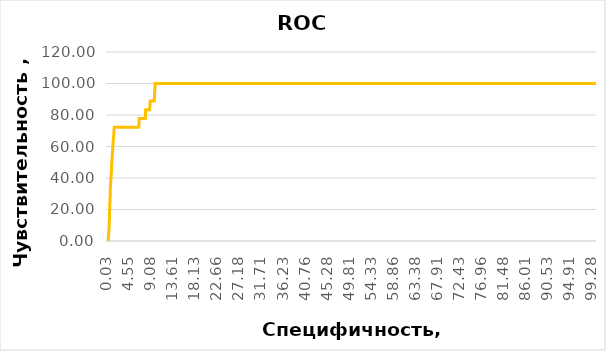
| Category | Series 0 |
|---|---|
| 0.029967036260113877 | 0 |
| 0.059934072520227755 | 0 |
| 0.08990110878034162 | 0 |
| 0.11986814504045551 | 0 |
| 0.1498351813005694 | 0 |
| 0.17980221756068324 | 0 |
| 0.2097692538207971 | 0 |
| 0.23973629008091102 | 0 |
| 0.26970332634102484 | 0 |
| 0.2996703626011388 | 0 |
| 0.3296373988612526 | 0 |
| 0.3596044351213665 | 0 |
| 0.3895714713814804 | 5.556 |
| 0.4195385076415942 | 5.556 |
| 0.4495055439017081 | 5.556 |
| 0.47947258016182204 | 11.111 |
| 0.5094396164219359 | 11.111 |
| 0.5394066526820497 | 16.667 |
| 0.5693736889421637 | 22.222 |
| 0.5993407252022775 | 22.222 |
| 0.6293077614623913 | 22.222 |
| 0.6592747977225052 | 27.778 |
| 0.6892418339826192 | 33.333 |
| 0.719208870242733 | 33.333 |
| 0.7491759065028468 | 33.333 |
| 0.7791429427629608 | 33.333 |
| 0.8091099790230747 | 38.889 |
| 0.8390770152831885 | 38.889 |
| 0.8690440515433023 | 38.889 |
| 0.8990110878034162 | 38.889 |
| 0.92897812406353 | 44.444 |
| 0.9589451603236441 | 44.444 |
| 0.988912196583758 | 50 |
| 1.0188792328438718 | 50 |
| 1.0488462691039857 | 50 |
| 1.0788133053640994 | 50 |
| 1.1087803416242132 | 50 |
| 1.1387473778843273 | 55.556 |
| 1.1687144141444412 | 55.556 |
| 1.198681450404555 | 55.556 |
| 1.228648486664669 | 61.111 |
| 1.2586155229247826 | 61.111 |
| 1.2885825591848965 | 61.111 |
| 1.3185495954450104 | 61.111 |
| 1.3485166317051245 | 61.111 |
| 1.3784836679652384 | 66.667 |
| 1.4084507042253522 | 66.667 |
| 1.438417740485466 | 66.667 |
| 1.4683847767455798 | 66.667 |
| 1.4983518130056936 | 72.222 |
| 1.5283188492658075 | 72.222 |
| 1.5582858855259216 | 72.222 |
| 1.5882529217860355 | 72.222 |
| 1.6182199580461494 | 72.222 |
| 1.648186994306263 | 72.222 |
| 1.678154030566377 | 72.222 |
| 1.7081210668264908 | 72.222 |
| 1.7380881030866047 | 72.222 |
| 1.7680551393467185 | 72.222 |
| 1.7980221756068324 | 72.222 |
| 1.8279892118669463 | 72.222 |
| 1.85795624812706 | 72.222 |
| 1.8879232843871743 | 72.222 |
| 1.9178903206472881 | 72.222 |
| 1.947857356907402 | 72.222 |
| 1.977824393167516 | 72.222 |
| 2.0077914294276296 | 72.222 |
| 2.0377584656877437 | 72.222 |
| 2.0677255019478573 | 72.222 |
| 2.0976925382079714 | 72.222 |
| 2.127659574468085 | 72.222 |
| 2.1576266107281987 | 72.222 |
| 2.187593646988313 | 72.222 |
| 2.2175606832484265 | 72.222 |
| 2.2475277195085406 | 72.222 |
| 2.2774947557686547 | 72.222 |
| 2.3074617920287683 | 72.222 |
| 2.3374288282888824 | 72.222 |
| 2.367395864548996 | 72.222 |
| 2.39736290080911 | 72.222 |
| 2.427329937069224 | 72.222 |
| 2.457296973329338 | 72.222 |
| 2.4872640095894516 | 72.222 |
| 2.5172310458495653 | 72.222 |
| 2.5471980821096794 | 72.222 |
| 2.577165118369793 | 72.222 |
| 2.607132154629907 | 72.222 |
| 2.6370991908900208 | 72.222 |
| 2.667066227150135 | 72.222 |
| 2.697033263410249 | 72.222 |
| 2.7270002996703626 | 72.222 |
| 2.7569673359304767 | 72.222 |
| 2.7869343721905904 | 72.222 |
| 2.8169014084507045 | 72.222 |
| 2.846868444710818 | 72.222 |
| 2.876835480970932 | 72.222 |
| 2.906802517231046 | 72.222 |
| 2.9367695534911595 | 72.222 |
| 2.9667365897512736 | 72.222 |
| 2.9967036260113873 | 72.222 |
| 3.0266706622715014 | 72.222 |
| 3.056637698531615 | 72.222 |
| 3.086604734791729 | 72.222 |
| 3.1165717710518432 | 72.222 |
| 3.146538807311957 | 72.222 |
| 3.176505843572071 | 72.222 |
| 3.2064728798321847 | 72.222 |
| 3.2364399160922988 | 72.222 |
| 3.2664069523524124 | 72.222 |
| 3.296373988612526 | 72.222 |
| 3.32634102487264 | 72.222 |
| 3.356308061132754 | 72.222 |
| 3.386275097392868 | 72.222 |
| 3.4162421336529816 | 72.222 |
| 3.4462091699130957 | 72.222 |
| 3.4761762061732093 | 72.222 |
| 3.506143242433323 | 72.222 |
| 3.536110278693437 | 72.222 |
| 3.5660773149535507 | 72.222 |
| 3.596044351213665 | 72.222 |
| 3.6260113874737785 | 72.222 |
| 3.6559784237338926 | 72.222 |
| 3.6859454599940062 | 72.222 |
| 3.71591249625412 | 72.222 |
| 3.745879532514235 | 72.222 |
| 3.7758465687743485 | 72.222 |
| 3.805813605034462 | 72.222 |
| 3.8357806412945763 | 72.222 |
| 3.86574767755469 | 72.222 |
| 3.895714713814804 | 72.222 |
| 3.9256817500749177 | 72.222 |
| 3.955648786335032 | 72.222 |
| 3.9856158225951455 | 72.222 |
| 4.015582858855259 | 72.222 |
| 4.045549895115373 | 72.222 |
| 4.075516931375487 | 72.222 |
| 4.1054839676356005 | 72.222 |
| 4.135451003895715 | 72.222 |
| 4.165418040155829 | 72.222 |
| 4.195385076415943 | 72.222 |
| 4.225352112676056 | 72.222 |
| 4.25531914893617 | 72.222 |
| 4.285286185196284 | 72.222 |
| 4.3152532214563974 | 72.222 |
| 4.3452202577165115 | 72.222 |
| 4.375187293976626 | 72.222 |
| 4.40515433023674 | 72.222 |
| 4.435121366496853 | 72.222 |
| 4.465088402756967 | 72.222 |
| 4.495055439017081 | 72.222 |
| 4.525022475277194 | 72.222 |
| 4.554989511537309 | 72.222 |
| 4.5849565477974235 | 72.222 |
| 4.614923584057537 | 72.222 |
| 4.644890620317651 | 72.222 |
| 4.674857656577765 | 72.222 |
| 4.704824692837879 | 72.222 |
| 4.734791729097992 | 72.222 |
| 4.764758765358106 | 72.222 |
| 4.79472580161822 | 72.222 |
| 4.824692837878334 | 72.222 |
| 4.854659874138448 | 72.222 |
| 4.884626910398562 | 72.222 |
| 4.914593946658676 | 72.222 |
| 4.944560982918789 | 72.222 |
| 4.974528019178903 | 72.222 |
| 5.004495055439017 | 72.222 |
| 5.0344620916991305 | 72.222 |
| 5.064429127959245 | 72.222 |
| 5.094396164219359 | 72.222 |
| 5.124363200479473 | 72.222 |
| 5.154330236739586 | 72.222 |
| 5.1842972729997 | 72.222 |
| 5.214264309259814 | 72.222 |
| 5.244231345519927 | 72.222 |
| 5.2741983817800415 | 72.222 |
| 5.304165418040156 | 72.222 |
| 5.33413245430027 | 72.222 |
| 5.364099490560383 | 72.222 |
| 5.394066526820498 | 72.222 |
| 5.424033563080612 | 72.222 |
| 5.454000599340725 | 72.222 |
| 5.483967635600839 | 72.222 |
| 5.513934671860953 | 72.222 |
| 5.543901708121067 | 72.222 |
| 5.573868744381181 | 72.222 |
| 5.603835780641295 | 72.222 |
| 5.633802816901409 | 72.222 |
| 5.663769853161522 | 72.222 |
| 5.693736889421636 | 72.222 |
| 5.72370392568175 | 72.222 |
| 5.753670961941864 | 72.222 |
| 5.783637998201978 | 72.222 |
| 5.813605034462092 | 72.222 |
| 5.843572070722206 | 72.222 |
| 5.873539106982319 | 72.222 |
| 5.903506143242433 | 72.222 |
| 5.933473179502547 | 72.222 |
| 5.963440215762661 | 72.222 |
| 5.993407252022775 | 72.222 |
| 6.023374288282889 | 72.222 |
| 6.053341324543003 | 72.222 |
| 6.083308360803116 | 72.222 |
| 6.11327539706323 | 72.222 |
| 6.143242433323344 | 72.222 |
| 6.173209469583458 | 72.222 |
| 6.203176505843572 | 72.222 |
| 6.2331435421036865 | 72.222 |
| 6.2631105783638 | 72.222 |
| 6.293077614623914 | 72.222 |
| 6.323044650884027 | 72.222 |
| 6.353011687144142 | 72.222 |
| 6.382978723404255 | 72.222 |
| 6.412945759664369 | 72.222 |
| 6.4429127959244825 | 72.222 |
| 6.4728798321845975 | 72.222 |
| 6.50284686844471 | 72.222 |
| 6.532813904704825 | 72.222 |
| 6.562780940964938 | 72.222 |
| 6.592747977225052 | 72.222 |
| 6.622715013485167 | 77.778 |
| 6.65268204974528 | 77.778 |
| 6.682649086005394 | 77.778 |
| 6.712616122265508 | 77.778 |
| 6.742583158525623 | 77.778 |
| 6.772550194785736 | 77.778 |
| 6.80251723104585 | 77.778 |
| 6.832484267305963 | 77.778 |
| 6.862451303566078 | 77.778 |
| 6.892418339826191 | 77.778 |
| 6.922385376086305 | 77.778 |
| 6.952352412346419 | 77.778 |
| 6.982319448606534 | 77.778 |
| 7.012286484866646 | 77.778 |
| 7.042253521126761 | 77.778 |
| 7.072220557386874 | 77.778 |
| 7.102187593646988 | 77.778 |
| 7.1321546299071015 | 77.778 |
| 7.1621216661672165 | 77.778 |
| 7.19208870242733 | 77.778 |
| 7.222055738687444 | 77.778 |
| 7.252022774947557 | 77.778 |
| 7.281989811207672 | 77.778 |
| 7.311956847467785 | 77.778 |
| 7.341923883727899 | 77.778 |
| 7.3718909199880125 | 77.778 |
| 7.4018579562481275 | 77.778 |
| 7.43182499250824 | 77.778 |
| 7.461792028768355 | 77.778 |
| 7.49175906502847 | 77.778 |
| 7.521726101288582 | 77.778 |
| 7.551693137548697 | 77.778 |
| 7.58166017380881 | 77.778 |
| 7.611627210068924 | 77.778 |
| 7.641594246329038 | 77.778 |
| 7.671561282589153 | 77.778 |
| 7.701528318849266 | 77.778 |
| 7.73149535510938 | 77.778 |
| 7.761462391369493 | 77.778 |
| 7.791429427629608 | 77.778 |
| 7.821396463889721 | 77.778 |
| 7.851363500149835 | 77.778 |
| 7.881330536409949 | 77.778 |
| 7.911297572670064 | 77.778 |
| 7.941264608930176 | 83.333 |
| 7.971231645190291 | 83.333 |
| 8.001198681450404 | 83.333 |
| 8.031165717710518 | 83.333 |
| 8.061132753970632 | 83.333 |
| 8.091099790230746 | 83.333 |
| 8.121066826490859 | 83.333 |
| 8.151033862750975 | 83.333 |
| 8.181000899011087 | 83.333 |
| 8.210967935271201 | 83.333 |
| 8.240934971531315 | 83.333 |
| 8.27090200779143 | 83.333 |
| 8.300869044051543 | 83.333 |
| 8.330836080311657 | 83.333 |
| 8.360803116571772 | 83.333 |
| 8.390770152831886 | 83.333 |
| 8.420737189092 | 83.333 |
| 8.450704225352112 | 83.333 |
| 8.480671261612226 | 83.333 |
| 8.51063829787234 | 83.333 |
| 8.540605334132454 | 83.333 |
| 8.570572370392568 | 83.333 |
| 8.600539406652683 | 83.333 |
| 8.630506442912795 | 83.333 |
| 8.66047347917291 | 83.333 |
| 8.690440515433023 | 83.333 |
| 8.720407551693137 | 83.333 |
| 8.750374587953251 | 83.333 |
| 8.780341624213365 | 83.333 |
| 8.81030866047348 | 83.333 |
| 8.840275696733594 | 83.333 |
| 8.870242732993706 | 88.889 |
| 8.900209769253822 | 88.889 |
| 8.930176805513934 | 88.889 |
| 8.960143841774048 | 88.889 |
| 8.990110878034162 | 88.889 |
| 9.020077914294276 | 88.889 |
| 9.050044950554389 | 88.889 |
| 9.080011986814505 | 88.889 |
| 9.109979023074619 | 88.889 |
| 9.139946059334731 | 88.889 |
| 9.169913095594847 | 88.889 |
| 9.19988013185496 | 88.889 |
| 9.229847168115073 | 88.889 |
| 9.259814204375187 | 88.889 |
| 9.289781240635302 | 88.889 |
| 9.319748276895416 | 88.889 |
| 9.34971531315553 | 88.889 |
| 9.379682349415642 | 88.889 |
| 9.409649385675758 | 88.889 |
| 9.43961642193587 | 88.889 |
| 9.469583458195984 | 88.889 |
| 9.499550494456098 | 88.889 |
| 9.529517530716213 | 88.889 |
| 9.559484566976325 | 88.889 |
| 9.58945160323644 | 88.889 |
| 9.619418639496553 | 88.889 |
| 9.649385675756667 | 88.889 |
| 9.679352712016781 | 88.889 |
| 9.709319748276895 | 88.889 |
| 9.73928678453701 | 88.889 |
| 9.769253820797124 | 88.889 |
| 9.799220857057236 | 94.444 |
| 9.829187893317352 | 94.444 |
| 9.859154929577464 | 94.444 |
| 9.889121965837578 | 100 |
| 9.919089002097694 | 100 |
| 9.949056038357806 | 100 |
| 9.97902307461792 | 100 |
| 10.008990110878035 | 100 |
| 10.038957147138149 | 100 |
| 10.068924183398261 | 100 |
| 10.098891219658377 | 100 |
| 10.12885825591849 | 100 |
| 10.158825292178603 | 100 |
| 10.188792328438717 | 100 |
| 10.218759364698832 | 100 |
| 10.248726400958946 | 100 |
| 10.27869343721906 | 100 |
| 10.308660473479172 | 100 |
| 10.338627509739288 | 100 |
| 10.3685945459994 | 100 |
| 10.398561582259514 | 100 |
| 10.428528618519628 | 100 |
| 10.458495654779743 | 100 |
| 10.488462691039855 | 100 |
| 10.51842972729997 | 100 |
| 10.548396763560083 | 100 |
| 10.578363799820197 | 100 |
| 10.608330836080311 | 100 |
| 10.638297872340425 | 100 |
| 10.66826490860054 | 100 |
| 10.698231944860654 | 100 |
| 10.728198981120766 | 100 |
| 10.758166017380882 | 100 |
| 10.788133053640996 | 100 |
| 10.818100089901108 | 100 |
| 10.848067126161224 | 100 |
| 10.878034162421336 | 100 |
| 10.90800119868145 | 100 |
| 10.937968234941565 | 100 |
| 10.967935271201679 | 100 |
| 10.997902307461791 | 100 |
| 11.027869343721907 | 100 |
| 11.05783637998202 | 100 |
| 11.087803416242133 | 100 |
| 11.117770452502247 | 100 |
| 11.147737488762361 | 100 |
| 11.177704525022476 | 100 |
| 11.20767156128259 | 100 |
| 11.237638597542702 | 100 |
| 11.267605633802818 | 100 |
| 11.29757267006293 | 100 |
| 11.327539706323044 | 100 |
| 11.357506742583158 | 100 |
| 11.387473778843272 | 100 |
| 11.417440815103387 | 100 |
| 11.4474078513635 | 100 |
| 11.477374887623613 | 100 |
| 11.507341923883727 | 100 |
| 11.537308960143841 | 100 |
| 11.567275996403955 | 100 |
| 11.59724303266407 | 100 |
| 11.627210068924184 | 100 |
| 11.657177105184298 | 100 |
| 11.687144141444412 | 100 |
| 11.717111177704526 | 100 |
| 11.747078213964638 | 100 |
| 11.777045250224754 | 100 |
| 11.807012286484866 | 100 |
| 11.83697932274498 | 100 |
| 11.866946359005095 | 100 |
| 11.896913395265209 | 100 |
| 11.926880431525323 | 100 |
| 11.956847467785437 | 100 |
| 11.98681450404555 | 100 |
| 12.016781540305663 | 100 |
| 12.046748576565777 | 100 |
| 12.076715612825891 | 100 |
| 12.106682649086006 | 100 |
| 12.13664968534612 | 100 |
| 12.166616721606232 | 100 |
| 12.196583757866348 | 100 |
| 12.22655079412646 | 100 |
| 12.256517830386574 | 100 |
| 12.286484866646688 | 100 |
| 12.316451902906802 | 100 |
| 12.346418939166917 | 100 |
| 12.37638597542703 | 100 |
| 12.406353011687145 | 100 |
| 12.436320047947259 | 100 |
| 12.466287084207373 | 100 |
| 12.496254120467485 | 100 |
| 12.5262211567276 | 100 |
| 12.556188192987713 | 100 |
| 12.586155229247828 | 100 |
| 12.616122265507942 | 100 |
| 12.646089301768054 | 100 |
| 12.676056338028168 | 100 |
| 12.706023374288284 | 100 |
| 12.735990410548398 | 100 |
| 12.76595744680851 | 100 |
| 12.795924483068625 | 100 |
| 12.825891519328739 | 100 |
| 12.855858555588853 | 100 |
| 12.885825591848965 | 100 |
| 12.91579262810908 | 100 |
| 12.945759664369195 | 100 |
| 12.975726700629309 | 100 |
| 13.00569373688942 | 100 |
| 13.035660773149536 | 100 |
| 13.06562780940965 | 100 |
| 13.095594845669764 | 100 |
| 13.125561881929876 | 100 |
| 13.15552891818999 | 100 |
| 13.185495954450104 | 100 |
| 13.21546299071022 | 100 |
| 13.245430026970334 | 100 |
| 13.275397063230447 | 100 |
| 13.30536409949056 | 100 |
| 13.335331135750675 | 100 |
| 13.365298172010789 | 100 |
| 13.395265208270901 | 100 |
| 13.425232244531015 | 100 |
| 13.455199280791131 | 100 |
| 13.485166317051245 | 100 |
| 13.515133353311356 | 100 |
| 13.545100389571472 | 100 |
| 13.575067425831586 | 100 |
| 13.6050344620917 | 100 |
| 13.635001498351812 | 100 |
| 13.664968534611926 | 100 |
| 13.69493557087204 | 100 |
| 13.724902607132156 | 100 |
| 13.754869643392267 | 100 |
| 13.784836679652383 | 100 |
| 13.814803715912497 | 100 |
| 13.84477075217261 | 100 |
| 13.874737788432723 | 100 |
| 13.904704824692837 | 100 |
| 13.934671860952951 | 100 |
| 13.964638897213067 | 100 |
| 13.994605933473178 | 100 |
| 14.024572969733292 | 100 |
| 14.054540005993408 | 100 |
| 14.084507042253522 | 100 |
| 14.114474078513636 | 100 |
| 14.144441114773748 | 100 |
| 14.174408151033862 | 100 |
| 14.204375187293977 | 100 |
| 14.234342223554092 | 100 |
| 14.264309259814203 | 100 |
| 14.294276296074319 | 100 |
| 14.324243332334433 | 100 |
| 14.354210368594547 | 100 |
| 14.38417740485466 | 100 |
| 14.414144441114773 | 100 |
| 14.444111477374888 | 100 |
| 14.474078513635003 | 100 |
| 14.504045549895114 | 100 |
| 14.534012586155228 | 100 |
| 14.563979622415344 | 100 |
| 14.593946658675458 | 100 |
| 14.62391369493557 | 100 |
| 14.653880731195684 | 100 |
| 14.683847767455799 | 100 |
| 14.713814803715913 | 100 |
| 14.743781839976025 | 100 |
| 14.773748876236139 | 100 |
| 14.803715912496255 | 100 |
| 14.833682948756369 | 100 |
| 14.86364998501648 | 100 |
| 14.893617021276595 | 100 |
| 14.92358405753671 | 100 |
| 14.953551093796824 | 100 |
| 14.98351813005694 | 100 |
| 15.01348516631705 | 100 |
| 15.043452202577164 | 100 |
| 15.07341923883728 | 100 |
| 15.103386275097394 | 100 |
| 15.133353311357506 | 100 |
| 15.16332034761762 | 100 |
| 15.193287383877735 | 100 |
| 15.223254420137849 | 100 |
| 15.253221456397961 | 100 |
| 15.283188492658075 | 100 |
| 15.313155528918191 | 100 |
| 15.343122565178305 | 100 |
| 15.373089601438416 | 100 |
| 15.403056637698532 | 100 |
| 15.433023673958646 | 100 |
| 15.46299071021876 | 100 |
| 15.492957746478872 | 100 |
| 15.522924782738986 | 100 |
| 15.5528918189991 | 100 |
| 15.582858855259216 | 100 |
| 15.612825891519327 | 100 |
| 15.642792927779443 | 100 |
| 15.672759964039557 | 100 |
| 15.70272700029967 | 100 |
| 15.732694036559785 | 100 |
| 15.762661072819897 | 100 |
| 15.792628109080011 | 100 |
| 15.822595145340127 | 100 |
| 15.852562181600241 | 100 |
| 15.882529217860352 | 100 |
| 15.912496254120468 | 100 |
| 15.942463290380582 | 100 |
| 15.972430326640696 | 100 |
| 16.00239736290081 | 100 |
| 16.032364399160922 | 100 |
| 16.062331435421036 | 100 |
| 16.09229847168115 | 100 |
| 16.122265507941265 | 100 |
| 16.15223254420138 | 100 |
| 16.182199580461493 | 100 |
| 16.212166616721607 | 100 |
| 16.242133652981718 | 100 |
| 16.272100689241835 | 100 |
| 16.30206772550195 | 100 |
| 16.332034761762063 | 100 |
| 16.362001798022174 | 100 |
| 16.391968834282288 | 100 |
| 16.421935870542402 | 100 |
| 16.451902906802516 | 100 |
| 16.48186994306263 | 100 |
| 16.511836979322744 | 100 |
| 16.54180401558286 | 100 |
| 16.571771051842973 | 100 |
| 16.601738088103087 | 100 |
| 16.6317051243632 | 100 |
| 16.661672160623315 | 100 |
| 16.69163919688343 | 100 |
| 16.721606233143543 | 100 |
| 16.751573269403654 | 100 |
| 16.78154030566377 | 100 |
| 16.811507341923885 | 100 |
| 16.841474378184 | 100 |
| 16.87144141444411 | 100 |
| 16.901408450704224 | 100 |
| 16.93137548696434 | 100 |
| 16.961342523224452 | 100 |
| 16.991309559484566 | 100 |
| 17.02127659574468 | 100 |
| 17.051243632004795 | 100 |
| 17.08121066826491 | 100 |
| 17.111177704525023 | 100 |
| 17.141144740785137 | 100 |
| 17.17111177704525 | 100 |
| 17.201078813305365 | 100 |
| 17.231045849565476 | 100 |
| 17.26101288582559 | 100 |
| 17.290979922085707 | 100 |
| 17.32094695834582 | 100 |
| 17.350913994605932 | 100 |
| 17.380881030866046 | 100 |
| 17.41084806712616 | 100 |
| 17.440815103386274 | 100 |
| 17.47078213964639 | 100 |
| 17.500749175906503 | 100 |
| 17.530716212166617 | 100 |
| 17.56068324842673 | 100 |
| 17.590650284686845 | 100 |
| 17.62061732094696 | 100 |
| 17.650584357207073 | 100 |
| 17.680551393467187 | 100 |
| 17.7105184297273 | 100 |
| 17.740485465987412 | 100 |
| 17.770452502247526 | 100 |
| 17.800419538507644 | 100 |
| 17.830386574767758 | 100 |
| 17.86035361102787 | 100 |
| 17.890320647287982 | 100 |
| 17.920287683548096 | 100 |
| 17.95025471980821 | 100 |
| 17.980221756068325 | 100 |
| 18.01018879232844 | 100 |
| 18.040155828588553 | 100 |
| 18.070122864848667 | 100 |
| 18.100089901108777 | 100 |
| 18.130056937368895 | 100 |
| 18.16002397362901 | 100 |
| 18.189991009889123 | 100 |
| 18.219958046149237 | 100 |
| 18.249925082409348 | 100 |
| 18.279892118669462 | 100 |
| 18.30985915492958 | 100 |
| 18.339826191189694 | 100 |
| 18.369793227449804 | 100 |
| 18.39976026370992 | 100 |
| 18.429727299970033 | 100 |
| 18.459694336230147 | 100 |
| 18.48966137249026 | 100 |
| 18.519628408750375 | 100 |
| 18.54959544501049 | 100 |
| 18.579562481270603 | 100 |
| 18.609529517530714 | 100 |
| 18.63949655379083 | 100 |
| 18.669463590050945 | 100 |
| 18.69943062631106 | 100 |
| 18.72939766257117 | 100 |
| 18.759364698831284 | 100 |
| 18.789331735091398 | 100 |
| 18.819298771351516 | 100 |
| 18.849265807611626 | 100 |
| 18.87923284387174 | 100 |
| 18.909199880131855 | 100 |
| 18.93916691639197 | 100 |
| 18.969133952652083 | 100 |
| 18.999100988912197 | 100 |
| 19.02906802517231 | 100 |
| 19.059035061432425 | 100 |
| 19.08900209769254 | 100 |
| 19.11896913395265 | 100 |
| 19.148936170212767 | 100 |
| 19.17890320647288 | 100 |
| 19.208870242732996 | 100 |
| 19.238837278993106 | 100 |
| 19.26880431525322 | 100 |
| 19.298771351513334 | 100 |
| 19.328738387773452 | 100 |
| 19.358705424033563 | 100 |
| 19.388672460293677 | 100 |
| 19.41863949655379 | 100 |
| 19.448606532813905 | 100 |
| 19.47857356907402 | 100 |
| 19.508540605334133 | 100 |
| 19.538507641594247 | 100 |
| 19.56847467785436 | 100 |
| 19.598441714114472 | 100 |
| 19.628408750374586 | 100 |
| 19.658375786634704 | 100 |
| 19.688342822894818 | 100 |
| 19.718309859154928 | 100 |
| 19.748276895415042 | 100 |
| 19.778243931675156 | 100 |
| 19.80821096793527 | 100 |
| 19.838178004195388 | 100 |
| 19.8681450404555 | 100 |
| 19.898112076715613 | 100 |
| 19.928079112975727 | 100 |
| 19.95804614923584 | 100 |
| 19.988013185495955 | 100 |
| 20.01798022175607 | 100 |
| 20.047947258016183 | 100 |
| 20.077914294276297 | 100 |
| 20.107881330536408 | 100 |
| 20.137848366796522 | 100 |
| 20.16781540305664 | 100 |
| 20.197782439316754 | 100 |
| 20.227749475576864 | 100 |
| 20.25771651183698 | 100 |
| 20.287683548097093 | 100 |
| 20.317650584357207 | 100 |
| 20.34761762061732 | 100 |
| 20.377584656877435 | 100 |
| 20.40755169313755 | 100 |
| 20.437518729397663 | 100 |
| 20.467485765657774 | 100 |
| 20.49745280191789 | 100 |
| 20.527419838178005 | 100 |
| 20.55738687443812 | 100 |
| 20.58735391069823 | 100 |
| 20.617320946958344 | 100 |
| 20.647287983218458 | 100 |
| 20.677255019478576 | 100 |
| 20.70722205573869 | 100 |
| 20.7371890919988 | 100 |
| 20.767156128258915 | 100 |
| 20.79712316451903 | 100 |
| 20.827090200779143 | 100 |
| 20.857057237039257 | 100 |
| 20.88702427329937 | 100 |
| 20.916991309559485 | 100 |
| 20.9469583458196 | 100 |
| 20.97692538207971 | 100 |
| 21.006892418339827 | 100 |
| 21.03685945459994 | 100 |
| 21.066826490860056 | 100 |
| 21.096793527120166 | 100 |
| 21.12676056338028 | 100 |
| 21.156727599640394 | 100 |
| 21.186694635900512 | 100 |
| 21.216661672160622 | 100 |
| 21.246628708420737 | 100 |
| 21.27659574468085 | 100 |
| 21.306562780940965 | 100 |
| 21.33652981720108 | 100 |
| 21.366496853461193 | 100 |
| 21.396463889721307 | 100 |
| 21.42643092598142 | 100 |
| 21.45639796224153 | 100 |
| 21.486364998501646 | 100 |
| 21.516332034761763 | 100 |
| 21.546299071021878 | 100 |
| 21.57626610728199 | 100 |
| 21.606233143542102 | 100 |
| 21.636200179802216 | 100 |
| 21.66616721606233 | 100 |
| 21.696134252322448 | 100 |
| 21.72610128858256 | 100 |
| 21.756068324842673 | 100 |
| 21.786035361102787 | 100 |
| 21.8160023973629 | 100 |
| 21.845969433623015 | 100 |
| 21.87593646988313 | 100 |
| 21.905903506143243 | 100 |
| 21.935870542403357 | 100 |
| 21.965837578663468 | 100 |
| 21.995804614923582 | 100 |
| 22.0257716511837 | 100 |
| 22.055738687443814 | 100 |
| 22.085705723703924 | 100 |
| 22.11567275996404 | 100 |
| 22.145639796224152 | 100 |
| 22.175606832484267 | 100 |
| 22.20557386874438 | 100 |
| 22.235540905004495 | 100 |
| 22.26550794126461 | 100 |
| 22.295474977524723 | 100 |
| 22.325442013784837 | 100 |
| 22.35540905004495 | 100 |
| 22.385376086305065 | 100 |
| 22.41534312256518 | 100 |
| 22.445310158825293 | 100 |
| 22.475277195085404 | 100 |
| 22.505244231345518 | 100 |
| 22.535211267605636 | 100 |
| 22.56517830386575 | 100 |
| 22.59514534012586 | 100 |
| 22.625112376385974 | 100 |
| 22.65507941264609 | 100 |
| 22.685046448906203 | 100 |
| 22.715013485166317 | 100 |
| 22.74498052142643 | 100 |
| 22.774947557686545 | 100 |
| 22.80491459394666 | 100 |
| 22.834881630206773 | 100 |
| 22.864848666466887 | 100 |
| 22.894815702727 | 100 |
| 22.924782738987115 | 100 |
| 22.954749775247226 | 100 |
| 22.98471681150734 | 100 |
| 23.014683847767454 | 100 |
| 23.044650884027572 | 100 |
| 23.074617920287682 | 100 |
| 23.104584956547797 | 100 |
| 23.13455199280791 | 100 |
| 23.164519029068025 | 100 |
| 23.19448606532814 | 100 |
| 23.224453101588253 | 100 |
| 23.254420137848367 | 100 |
| 23.28438717410848 | 100 |
| 23.314354210368595 | 100 |
| 23.34432124662871 | 100 |
| 23.374288282888823 | 100 |
| 23.404255319148938 | 100 |
| 23.43422235540905 | 100 |
| 23.464189391669162 | 100 |
| 23.494156427929276 | 100 |
| 23.52412346418939 | 100 |
| 23.554090500449508 | 100 |
| 23.58405753670962 | 100 |
| 23.614024572969733 | 100 |
| 23.643991609229847 | 100 |
| 23.67395864548996 | 100 |
| 23.703925681750075 | 100 |
| 23.73389271801019 | 100 |
| 23.763859754270303 | 100 |
| 23.793826790530417 | 100 |
| 23.823793826790528 | 100 |
| 23.853760863050645 | 100 |
| 23.88372789931076 | 100 |
| 23.913694935570874 | 100 |
| 23.943661971830984 | 100 |
| 23.9736290080911 | 100 |
| 24.003596044351212 | 100 |
| 24.033563080611327 | 100 |
| 24.063530116871444 | 100 |
| 24.093497153131555 | 100 |
| 24.12346418939167 | 100 |
| 24.153431225651783 | 100 |
| 24.183398261911897 | 100 |
| 24.21336529817201 | 100 |
| 24.243332334432125 | 100 |
| 24.27329937069224 | 100 |
| 24.303266406952353 | 100 |
| 24.333233443212464 | 100 |
| 24.36320047947258 | 100 |
| 24.393167515732696 | 100 |
| 24.42313455199281 | 100 |
| 24.45310158825292 | 100 |
| 24.483068624513034 | 100 |
| 24.51303566077315 | 100 |
| 24.543002697033263 | 100 |
| 24.572969733293377 | 100 |
| 24.60293676955349 | 100 |
| 24.632903805813605 | 100 |
| 24.66287084207372 | 100 |
| 24.692837878333833 | 100 |
| 24.722804914593947 | 100 |
| 24.75277195085406 | 100 |
| 24.782738987114175 | 100 |
| 24.81270602337429 | 100 |
| 24.8426730596344 | 100 |
| 24.872640095894518 | 100 |
| 24.902607132154632 | 100 |
| 24.932574168414746 | 100 |
| 24.962541204674856 | 100 |
| 24.99250824093497 | 100 |
| 25.022475277195085 | 100 |
| 25.0524423134552 | 100 |
| 25.082409349715313 | 100 |
| 25.112376385975427 | 100 |
| 25.14234342223554 | 100 |
| 25.172310458495655 | 100 |
| 25.20227749475577 | 100 |
| 25.232244531015883 | 100 |
| 25.262211567275994 | 100 |
| 25.292178603536108 | 100 |
| 25.322145639796222 | 100 |
| 25.352112676056336 | 100 |
| 25.382079712316454 | 100 |
| 25.412046748576568 | 100 |
| 25.442013784836682 | 100 |
| 25.471980821096796 | 100 |
| 25.501947857356903 | 100 |
| 25.53191489361702 | 100 |
| 25.561881929877135 | 100 |
| 25.59184896613725 | 100 |
| 25.621816002397363 | 100 |
| 25.651783038657477 | 100 |
| 25.68175007491759 | 100 |
| 25.711717111177705 | 100 |
| 25.74168414743782 | 100 |
| 25.77165118369793 | 100 |
| 25.801618219958044 | 100 |
| 25.83158525621816 | 100 |
| 25.861552292478272 | 100 |
| 25.89151932873839 | 100 |
| 25.921486364998504 | 100 |
| 25.951453401258618 | 100 |
| 25.981420437518732 | 100 |
| 26.01138747377884 | 100 |
| 26.041354510038957 | 100 |
| 26.07132154629907 | 100 |
| 26.101288582559185 | 100 |
| 26.1312556188193 | 100 |
| 26.161222655079413 | 100 |
| 26.191189691339527 | 100 |
| 26.22115672759964 | 100 |
| 26.251123763859752 | 100 |
| 26.281090800119866 | 100 |
| 26.31105783637998 | 100 |
| 26.341024872640094 | 100 |
| 26.37099190890021 | 100 |
| 26.400958945160326 | 100 |
| 26.43092598142044 | 100 |
| 26.460893017680554 | 100 |
| 26.49086005394067 | 100 |
| 26.520827090200775 | 100 |
| 26.550794126460893 | 100 |
| 26.580761162721007 | 100 |
| 26.61072819898112 | 100 |
| 26.640695235241235 | 100 |
| 26.67066227150135 | 100 |
| 26.700629307761464 | 100 |
| 26.730596344021578 | 100 |
| 26.76056338028169 | 100 |
| 26.790530416541802 | 100 |
| 26.820497452801916 | 100 |
| 26.85046448906203 | 100 |
| 26.880431525322145 | 100 |
| 26.910398561582262 | 100 |
| 26.940365597842376 | 100 |
| 26.97033263410249 | 100 |
| 27.000299670362597 | 100 |
| 27.03026670662271 | 100 |
| 27.06023374288283 | 100 |
| 27.090200779142943 | 100 |
| 27.120167815403057 | 100 |
| 27.15013485166317 | 100 |
| 27.180101887923286 | 100 |
| 27.2100689241834 | 100 |
| 27.24003596044351 | 100 |
| 27.270002996703624 | 100 |
| 27.29997003296374 | 100 |
| 27.329937069223853 | 100 |
| 27.359904105483967 | 100 |
| 27.38987114174408 | 100 |
| 27.4198381780042 | 100 |
| 27.449805214264313 | 100 |
| 27.479772250524427 | 100 |
| 27.509739286784534 | 100 |
| 27.539706323044648 | 100 |
| 27.569673359304765 | 100 |
| 27.59964039556488 | 100 |
| 27.629607431824994 | 100 |
| 27.659574468085108 | 100 |
| 27.68954150434522 | 100 |
| 27.719508540605336 | 100 |
| 27.749475576865446 | 100 |
| 27.77944261312556 | 100 |
| 27.809409649385675 | 100 |
| 27.83937668564579 | 100 |
| 27.869343721905903 | 100 |
| 27.899310758166017 | 100 |
| 27.929277794426135 | 100 |
| 27.95924483068625 | 100 |
| 27.989211866946356 | 100 |
| 28.01917890320647 | 100 |
| 28.049145939466584 | 100 |
| 28.0791129757267 | 100 |
| 28.109080011986816 | 100 |
| 28.13904704824693 | 100 |
| 28.169014084507044 | 100 |
| 28.198981120767158 | 100 |
| 28.228948157027272 | 100 |
| 28.258915193287383 | 100 |
| 28.288882229547497 | 100 |
| 28.31884926580761 | 100 |
| 28.348816302067725 | 100 |
| 28.37878333832784 | 100 |
| 28.408750374587953 | 100 |
| 28.43871741084807 | 100 |
| 28.468684447108185 | 100 |
| 28.498651483368292 | 100 |
| 28.528618519628406 | 100 |
| 28.55858555588852 | 100 |
| 28.588552592148638 | 100 |
| 28.61851962840875 | 100 |
| 28.648486664668866 | 100 |
| 28.67845370092898 | 100 |
| 28.708420737189094 | 100 |
| 28.738387773449205 | 100 |
| 28.76835480970932 | 100 |
| 28.798321845969433 | 100 |
| 28.828288882229547 | 100 |
| 28.85825591848966 | 100 |
| 28.888222954749775 | 100 |
| 28.91818999100989 | 100 |
| 28.948157027270007 | 100 |
| 28.97812406353012 | 100 |
| 29.008091099790228 | 100 |
| 29.038058136050342 | 100 |
| 29.068025172310456 | 100 |
| 29.097992208570574 | 100 |
| 29.127959244830688 | 100 |
| 29.157926281090802 | 100 |
| 29.187893317350916 | 100 |
| 29.21786035361103 | 100 |
| 29.24782738987114 | 100 |
| 29.277794426131255 | 100 |
| 29.30776146239137 | 100 |
| 29.337728498651483 | 100 |
| 29.367695534911597 | 100 |
| 29.39766257117171 | 100 |
| 29.427629607431825 | 100 |
| 29.457596643691943 | 100 |
| 29.48756367995205 | 100 |
| 29.517530716212164 | 100 |
| 29.547497752472278 | 100 |
| 29.577464788732392 | 100 |
| 29.60743182499251 | 100 |
| 29.637398861252624 | 100 |
| 29.667365897512738 | 100 |
| 29.697332933772852 | 100 |
| 29.72729997003296 | 100 |
| 29.757267006293077 | 100 |
| 29.78723404255319 | 100 |
| 29.817201078813305 | 100 |
| 29.84716811507342 | 100 |
| 29.877135151333533 | 100 |
| 29.907102187593647 | 100 |
| 29.93706922385376 | 100 |
| 29.96703626011388 | 100 |
| 29.997003296373986 | 100 |
| 30.0269703326341 | 100 |
| 30.056937368894214 | 100 |
| 30.08690440515433 | 100 |
| 30.116871441414446 | 100 |
| 30.14683847767456 | 100 |
| 30.176805513934674 | 100 |
| 30.20677255019479 | 100 |
| 30.236739586454895 | 100 |
| 30.266706622715013 | 100 |
| 30.296673658975127 | 100 |
| 30.32664069523524 | 100 |
| 30.356607731495355 | 100 |
| 30.38657476775547 | 100 |
| 30.416541804015583 | 100 |
| 30.446508840275698 | 100 |
| 30.476475876535808 | 100 |
| 30.506442912795922 | 100 |
| 30.536409949056036 | 100 |
| 30.56637698531615 | 100 |
| 30.596344021576265 | 100 |
| 30.626311057836382 | 100 |
| 30.656278094096496 | 100 |
| 30.68624513035661 | 100 |
| 30.716212166616724 | 100 |
| 30.74617920287683 | 100 |
| 30.77614623913695 | 100 |
| 30.806113275397063 | 100 |
| 30.836080311657177 | 100 |
| 30.86604734791729 | 100 |
| 30.896014384177406 | 100 |
| 30.92598142043752 | 100 |
| 30.955948456697634 | 100 |
| 30.985915492957744 | 100 |
| 31.01588252921786 | 100 |
| 31.045849565477972 | 100 |
| 31.075816601738087 | 100 |
| 31.1057836379982 | 100 |
| 31.13575067425832 | 100 |
| 31.165717710518432 | 100 |
| 31.195684746778547 | 100 |
| 31.225651783038654 | 100 |
| 31.255618819298768 | 100 |
| 31.285585855558885 | 100 |
| 31.315552891819 | 100 |
| 31.345519928079113 | 100 |
| 31.375486964339228 | 100 |
| 31.40545400059934 | 100 |
| 31.435421036859456 | 100 |
| 31.46538807311957 | 100 |
| 31.49535510937968 | 100 |
| 31.525322145639795 | 100 |
| 31.55528918189991 | 100 |
| 31.585256218160023 | 100 |
| 31.615223254420137 | 100 |
| 31.645190290680254 | 100 |
| 31.67515732694037 | 100 |
| 31.705124363200483 | 100 |
| 31.73509139946059 | 100 |
| 31.765058435720704 | 100 |
| 31.79502547198082 | 100 |
| 31.824992508240936 | 100 |
| 31.85495954450105 | 100 |
| 31.884926580761164 | 100 |
| 31.914893617021278 | 100 |
| 31.944860653281392 | 100 |
| 31.974827689541502 | 100 |
| 32.00479472580162 | 100 |
| 32.034761762061734 | 100 |
| 32.064728798321845 | 100 |
| 32.09469583458196 | 100 |
| 32.12466287084207 | 100 |
| 32.15462990710219 | 100 |
| 32.1845969433623 | 100 |
| 32.21456397962241 | 100 |
| 32.24453101588253 | 100 |
| 32.27449805214264 | 100 |
| 32.30446508840276 | 100 |
| 32.33443212466287 | 100 |
| 32.364399160922986 | 100 |
| 32.3943661971831 | 100 |
| 32.424333233443214 | 100 |
| 32.45430026970333 | 100 |
| 32.484267305963435 | 100 |
| 32.51423434222355 | 100 |
| 32.54420137848367 | 100 |
| 32.57416841474378 | 100 |
| 32.6041354510039 | 100 |
| 32.63410248726401 | 100 |
| 32.66406952352413 | 100 |
| 32.69403655978424 | 100 |
| 32.72400359604435 | 100 |
| 32.753970632304465 | 100 |
| 32.783937668564576 | 100 |
| 32.813904704824694 | 100 |
| 32.843871741084804 | 100 |
| 32.87383877734492 | 100 |
| 32.90380581360503 | 100 |
| 32.93377284986515 | 100 |
| 32.96373988612526 | 100 |
| 32.99370692238537 | 100 |
| 33.02367395864549 | 100 |
| 33.05364099490561 | 100 |
| 33.08360803116572 | 100 |
| 33.113575067425835 | 100 |
| 33.143542103685945 | 100 |
| 33.17350913994606 | 100 |
| 33.20347617620617 | 100 |
| 33.233443212466284 | 100 |
| 33.2634102487264 | 100 |
| 33.29337728498651 | 100 |
| 33.32334432124663 | 100 |
| 33.35331135750674 | 100 |
| 33.38327839376686 | 100 |
| 33.413245430026976 | 100 |
| 33.443212466287086 | 100 |
| 33.4731795025472 | 100 |
| 33.50314653880731 | 100 |
| 33.533113575067425 | 100 |
| 33.56308061132754 | 100 |
| 33.59304764758765 | 100 |
| 33.62301468384777 | 100 |
| 33.65298172010788 | 100 |
| 33.682948756368 | 100 |
| 33.71291579262811 | 100 |
| 33.74288282888822 | 100 |
| 33.77284986514834 | 100 |
| 33.80281690140845 | 100 |
| 33.832783937668566 | 100 |
| 33.86275097392868 | 100 |
| 33.892718010188794 | 100 |
| 33.922685046448905 | 100 |
| 33.95265208270902 | 100 |
| 33.98261911896913 | 100 |
| 34.01258615522924 | 100 |
| 34.04255319148936 | 100 |
| 34.07252022774948 | 100 |
| 34.10248726400959 | 100 |
| 34.13245430026971 | 100 |
| 34.16242133652982 | 100 |
| 34.192388372789935 | 100 |
| 34.222355409050046 | 100 |
| 34.252322445310156 | 100 |
| 34.282289481570274 | 100 |
| 34.312256517830384 | 100 |
| 34.3422235540905 | 100 |
| 34.37219059035061 | 100 |
| 34.40215762661073 | 100 |
| 34.43212466287085 | 100 |
| 34.46209169913095 | 100 |
| 34.49205873539107 | 100 |
| 34.52202577165118 | 100 |
| 34.5519928079113 | 100 |
| 34.581959844171415 | 100 |
| 34.611926880431525 | 100 |
| 34.64189391669164 | 100 |
| 34.671860952951754 | 100 |
| 34.701827989211864 | 100 |
| 34.73179502547198 | 100 |
| 34.76176206173209 | 100 |
| 34.79172909799221 | 100 |
| 34.82169613425232 | 100 |
| 34.85166317051244 | 100 |
| 34.88163020677255 | 100 |
| 34.911597243032666 | 100 |
| 34.94156427929278 | 100 |
| 34.97153131555289 | 100 |
| 35.001498351813005 | 100 |
| 35.031465388073116 | 100 |
| 35.06143242433323 | 100 |
| 35.09139946059335 | 100 |
| 35.12136649685346 | 100 |
| 35.15133353311358 | 100 |
| 35.18130056937369 | 100 |
| 35.2112676056338 | 100 |
| 35.24123464189392 | 100 |
| 35.27120167815403 | 100 |
| 35.301168714414146 | 100 |
| 35.33113575067426 | 100 |
| 35.361102786934374 | 100 |
| 35.391069823194485 | 100 |
| 35.4210368594546 | 100 |
| 35.45100389571471 | 100 |
| 35.480970931974824 | 100 |
| 35.51093796823494 | 100 |
| 35.54090500449505 | 100 |
| 35.57087204075517 | 100 |
| 35.60083907701529 | 100 |
| 35.6308061132754 | 100 |
| 35.660773149535515 | 100 |
| 35.690740185795626 | 100 |
| 35.72070722205574 | 100 |
| 35.750674258315854 | 100 |
| 35.780641294575965 | 100 |
| 35.81060833083608 | 100 |
| 35.84057536709619 | 100 |
| 35.87054240335631 | 100 |
| 35.90050943961642 | 100 |
| 35.93047647587654 | 100 |
| 35.96044351213665 | 100 |
| 35.99041054839676 | 100 |
| 36.02037758465688 | 100 |
| 36.05034462091699 | 100 |
| 36.080311657177106 | 100 |
| 36.11027869343722 | 100 |
| 36.140245729697334 | 100 |
| 36.17021276595745 | 100 |
| 36.200179802217555 | 100 |
| 36.23014683847767 | 100 |
| 36.26011387473779 | 100 |
| 36.2900809109979 | 100 |
| 36.32004794725802 | 100 |
| 36.35001498351813 | 100 |
| 36.37998201977825 | 100 |
| 36.40994905603836 | 100 |
| 36.439916092298475 | 100 |
| 36.469883128558585 | 100 |
| 36.499850164818696 | 100 |
| 36.529817201078814 | 100 |
| 36.559784237338924 | 100 |
| 36.58975127359904 | 100 |
| 36.61971830985916 | 100 |
| 36.64968534611927 | 100 |
| 36.67965238237939 | 100 |
| 36.70961941863949 | 100 |
| 36.73958645489961 | 100 |
| 36.769553491159726 | 100 |
| 36.79952052741984 | 100 |
| 36.829487563679955 | 100 |
| 36.859454599940065 | 100 |
| 36.88942163620018 | 100 |
| 36.91938867246029 | 100 |
| 36.949355708720404 | 100 |
| 36.97932274498052 | 100 |
| 37.00928978124063 | 100 |
| 37.03925681750075 | 100 |
| 37.06922385376086 | 100 |
| 37.09919089002098 | 100 |
| 37.129157926281096 | 100 |
| 37.159124962541206 | 100 |
| 37.18909199880132 | 100 |
| 37.21905903506143 | 100 |
| 37.249026071321545 | 100 |
| 37.27899310758166 | 100 |
| 37.30896014384177 | 100 |
| 37.33892718010189 | 100 |
| 37.368894216362 | 100 |
| 37.39886125262212 | 100 |
| 37.42882828888223 | 100 |
| 37.45879532514234 | 100 |
| 37.48876236140246 | 100 |
| 37.51872939766257 | 100 |
| 37.548696433922686 | 100 |
| 37.578663470182796 | 100 |
| 37.608630506442914 | 100 |
| 37.63859754270303 | 100 |
| 37.66856457896314 | 100 |
| 37.69853161522325 | 100 |
| 37.72849865148336 | 100 |
| 37.75846568774348 | 100 |
| 37.7884327240036 | 100 |
| 37.81839976026371 | 100 |
| 37.84836679652383 | 100 |
| 37.87833383278394 | 100 |
| 37.908300869044055 | 100 |
| 37.938267905304166 | 100 |
| 37.968234941564276 | 100 |
| 37.998201977824394 | 100 |
| 38.028169014084504 | 100 |
| 38.05813605034462 | 100 |
| 38.08810308660473 | 100 |
| 38.11807012286485 | 100 |
| 38.14803715912497 | 100 |
| 38.17800419538508 | 100 |
| 38.20797123164519 | 100 |
| 38.2379382679053 | 100 |
| 38.26790530416542 | 100 |
| 38.297872340425535 | 100 |
| 38.327839376685645 | 100 |
| 38.35780641294576 | 100 |
| 38.38777344920587 | 100 |
| 38.41774048546599 | 100 |
| 38.4477075217261 | 100 |
| 38.47767455798621 | 100 |
| 38.50764159424633 | 100 |
| 38.53760863050644 | 100 |
| 38.56757566676656 | 100 |
| 38.59754270302667 | 100 |
| 38.627509739286786 | 100 |
| 38.657476775546904 | 100 |
| 38.68744381180701 | 100 |
| 38.717410848067125 | 100 |
| 38.747377884327236 | 100 |
| 38.77734492058735 | 100 |
| 38.80731195684747 | 100 |
| 38.83727899310758 | 100 |
| 38.8672460293677 | 100 |
| 38.89721306562781 | 100 |
| 38.92718010188793 | 100 |
| 38.95714713814804 | 100 |
| 38.98711417440815 | 100 |
| 39.017081210668266 | 100 |
| 39.04704824692838 | 100 |
| 39.077015283188494 | 100 |
| 39.106982319448605 | 100 |
| 39.13694935570872 | 100 |
| 39.16691639196884 | 100 |
| 39.196883428228944 | 100 |
| 39.22685046448906 | 100 |
| 39.25681750074917 | 100 |
| 39.28678453700929 | 100 |
| 39.31675157326941 | 100 |
| 39.34671860952952 | 100 |
| 39.376685645789635 | 100 |
| 39.406652682049746 | 100 |
| 39.436619718309856 | 100 |
| 39.466586754569974 | 100 |
| 39.496553790830085 | 100 |
| 39.5265208270902 | 100 |
| 39.55648786335031 | 100 |
| 39.58645489961043 | 100 |
| 39.61642193587054 | 100 |
| 39.64638897213066 | 100 |
| 39.676356008390776 | 100 |
| 39.70632304465088 | 100 |
| 39.736290080911 | 100 |
| 39.76625711717111 | 100 |
| 39.796224153431226 | 100 |
| 39.82619118969134 | 100 |
| 39.856158225951454 | 100 |
| 39.88612526221157 | 100 |
| 39.91609229847168 | 100 |
| 39.94605933473179 | 100 |
| 39.97602637099191 | 100 |
| 40.00599340725202 | 100 |
| 40.03596044351214 | 100 |
| 40.06592747977225 | 100 |
| 40.09589451603237 | 100 |
| 40.12586155229248 | 100 |
| 40.155828588552595 | 100 |
| 40.185795624812705 | 100 |
| 40.215762661072816 | 100 |
| 40.24572969733293 | 100 |
| 40.275696733593044 | 100 |
| 40.30566376985316 | 100 |
| 40.33563080611328 | 100 |
| 40.36559784237339 | 100 |
| 40.39556487863351 | 100 |
| 40.42553191489361 | 100 |
| 40.45549895115373 | 100 |
| 40.485465987413846 | 100 |
| 40.51543302367396 | 100 |
| 40.545400059934074 | 100 |
| 40.575367096194185 | 100 |
| 40.6053341324543 | 100 |
| 40.63530116871441 | 100 |
| 40.66526820497453 | 100 |
| 40.69523524123464 | 100 |
| 40.72520227749475 | 100 |
| 40.75516931375487 | 100 |
| 40.78513635001498 | 100 |
| 40.8151033862751 | 100 |
| 40.845070422535215 | 100 |
| 40.875037458795326 | 100 |
| 40.905004495055444 | 100 |
| 40.93497153131555 | 100 |
| 40.964938567575665 | 100 |
| 40.99490560383578 | 100 |
| 41.02487264009589 | 100 |
| 41.05483967635601 | 100 |
| 41.08480671261612 | 100 |
| 41.11477374887624 | 100 |
| 41.14474078513635 | 100 |
| 41.17470782139646 | 100 |
| 41.20467485765658 | 100 |
| 41.23464189391669 | 100 |
| 41.264608930176806 | 100 |
| 41.294575966436916 | 100 |
| 41.324543002697034 | 100 |
| 41.35451003895715 | 100 |
| 41.38447707521726 | 100 |
| 41.41444411147738 | 100 |
| 41.44441114773748 | 100 |
| 41.4743781839976 | 100 |
| 41.50434522025772 | 100 |
| 41.53431225651783 | 100 |
| 41.56427929277795 | 100 |
| 41.59424632903806 | 100 |
| 41.624213365298175 | 100 |
| 41.654180401558285 | 100 |
| 41.684147437818396 | 100 |
| 41.714114474078514 | 100 |
| 41.744081510338624 | 100 |
| 41.77404854659874 | 100 |
| 41.80401558285885 | 100 |
| 41.83398261911897 | 100 |
| 41.86394965537909 | 100 |
| 41.8939166916392 | 100 |
| 41.92388372789931 | 100 |
| 41.95385076415942 | 100 |
| 41.98381780041954 | 100 |
| 42.013784836679655 | 100 |
| 42.043751872939765 | 100 |
| 42.07371890919988 | 100 |
| 42.10368594545999 | 100 |
| 42.13365298172011 | 100 |
| 42.16362001798022 | 100 |
| 42.19358705424033 | 100 |
| 42.22355409050045 | 100 |
| 42.25352112676056 | 100 |
| 42.28348816302068 | 100 |
| 42.31345519928079 | 100 |
| 42.343422235540906 | 100 |
| 42.373389271801024 | 100 |
| 42.403356308061134 | 100 |
| 42.433323344321245 | 100 |
| 42.463290380581356 | 100 |
| 42.49325741684147 | 100 |
| 42.52322445310159 | 100 |
| 42.5531914893617 | 100 |
| 42.58315852562182 | 100 |
| 42.61312556188193 | 100 |
| 42.64309259814205 | 100 |
| 42.67305963440216 | 100 |
| 42.70302667066227 | 100 |
| 42.732993706922386 | 100 |
| 42.7629607431825 | 100 |
| 42.792927779442614 | 100 |
| 42.822894815702725 | 100 |
| 42.85286185196284 | 100 |
| 42.88282888822296 | 100 |
| 42.91279592448306 | 100 |
| 42.94276296074318 | 100 |
| 42.97272999700329 | 100 |
| 43.00269703326341 | 100 |
| 43.03266406952353 | 100 |
| 43.06263110578364 | 100 |
| 43.092598142043755 | 100 |
| 43.122565178303866 | 100 |
| 43.15253221456398 | 100 |
| 43.182499250824094 | 100 |
| 43.212466287084204 | 100 |
| 43.24243332334432 | 100 |
| 43.27240035960443 | 100 |
| 43.30236739586455 | 100 |
| 43.33233443212466 | 100 |
| 43.36230146838478 | 100 |
| 43.392268504644896 | 100 |
| 43.422235540905 | 100 |
| 43.45220257716512 | 100 |
| 43.48216961342523 | 100 |
| 43.512136649685345 | 100 |
| 43.54210368594546 | 100 |
| 43.572070722205574 | 100 |
| 43.60203775846569 | 100 |
| 43.6320047947258 | 100 |
| 43.66197183098591 | 100 |
| 43.69193886724603 | 100 |
| 43.72190590350614 | 100 |
| 43.75187293976626 | 100 |
| 43.78183997602637 | 100 |
| 43.811807012286486 | 100 |
| 43.8417740485466 | 100 |
| 43.871741084806715 | 100 |
| 43.90170812106683 | 100 |
| 43.931675157326936 | 100 |
| 43.96164219358705 | 100 |
| 43.991609229847164 | 100 |
| 44.02157626610728 | 100 |
| 44.0515433023674 | 100 |
| 44.08151033862751 | 100 |
| 44.11147737488763 | 100 |
| 44.14144441114774 | 100 |
| 44.17141144740785 | 100 |
| 44.201378483667966 | 100 |
| 44.23134551992808 | 100 |
| 44.261312556188194 | 100 |
| 44.291279592448305 | 100 |
| 44.32124662870842 | 100 |
| 44.35121366496853 | 100 |
| 44.38118070122865 | 100 |
| 44.41114773748876 | 100 |
| 44.44111477374887 | 100 |
| 44.47108181000899 | 100 |
| 44.5010488462691 | 100 |
| 44.53101588252922 | 100 |
| 44.560982918789335 | 100 |
| 44.590949955049446 | 100 |
| 44.620916991309564 | 100 |
| 44.650884027569674 | 100 |
| 44.680851063829785 | 100 |
| 44.7108181000899 | 100 |
| 44.74078513635001 | 100 |
| 44.77075217261013 | 100 |
| 44.80071920887024 | 100 |
| 44.83068624513036 | 100 |
| 44.86065328139047 | 100 |
| 44.89062031765059 | 100 |
| 44.9205873539107 | 100 |
| 44.95055439017081 | 100 |
| 44.980521426430926 | 100 |
| 45.010488462691036 | 100 |
| 45.040455498951154 | 100 |
| 45.07042253521127 | 100 |
| 45.10038957147138 | 100 |
| 45.1303566077315 | 100 |
| 45.1603236439916 | 100 |
| 45.19029068025172 | 100 |
| 45.22025771651184 | 100 |
| 45.25022475277195 | 100 |
| 45.28019178903207 | 100 |
| 45.31015882529218 | 100 |
| 45.340125861552295 | 100 |
| 45.370092897812405 | 100 |
| 45.400059934072516 | 100 |
| 45.430026970332634 | 100 |
| 45.459994006592744 | 100 |
| 45.48996104285286 | 100 |
| 45.51992807911297 | 100 |
| 45.54989511537309 | 100 |
| 45.57986215163321 | 100 |
| 45.60982918789332 | 100 |
| 45.639796224153436 | 100 |
| 45.669763260413546 | 100 |
| 45.69973029667366 | 100 |
| 45.729697332933775 | 100 |
| 45.759664369193885 | 100 |
| 45.789631405454 | 100 |
| 45.81959844171411 | 100 |
| 45.84956547797423 | 100 |
| 45.87953251423434 | 100 |
| 45.90949955049445 | 100 |
| 45.93946658675457 | 100 |
| 45.96943362301468 | 100 |
| 45.9994006592748 | 100 |
| 46.02936769553491 | 100 |
| 46.059334731795026 | 100 |
| 46.089301768055144 | 100 |
| 46.119268804315254 | 100 |
| 46.149235840575365 | 100 |
| 46.179202876835475 | 100 |
| 46.20916991309559 | 100 |
| 46.23913694935571 | 100 |
| 46.26910398561582 | 100 |
| 46.29907102187594 | 100 |
| 46.32903805813605 | 100 |
| 46.35900509439617 | 100 |
| 46.38897213065628 | 100 |
| 46.41893916691639 | 100 |
| 46.448906203176506 | 100 |
| 46.478873239436616 | 100 |
| 46.508840275696734 | 100 |
| 46.538807311956845 | 100 |
| 46.56877434821696 | 100 |
| 46.59874138447708 | 100 |
| 46.62870842073719 | 100 |
| 46.6586754569973 | 100 |
| 46.68864249325742 | 100 |
| 46.71860952951753 | 100 |
| 46.74857656577765 | 100 |
| 46.77854360203776 | 100 |
| 46.808510638297875 | 100 |
| 46.838477674557986 | 100 |
| 46.8684447108181 | 100 |
| 46.898411747078214 | 100 |
| 46.928378783338324 | 100 |
| 46.95834581959844 | 100 |
| 46.98831285585855 | 100 |
| 47.01827989211867 | 100 |
| 47.04824692837878 | 100 |
| 47.0782139646389 | 100 |
| 47.108181000899016 | 100 |
| 47.13814803715913 | 100 |
| 47.16811507341924 | 100 |
| 47.19808210967935 | 100 |
| 47.228049145939465 | 100 |
| 47.25801618219958 | 100 |
| 47.28798321845969 | 100 |
| 47.31795025471981 | 100 |
| 47.34791729097992 | 100 |
| 47.37788432724004 | 100 |
| 47.40785136350015 | 100 |
| 47.43781839976026 | 100 |
| 47.46778543602038 | 100 |
| 47.49775247228049 | 100 |
| 47.527719508540606 | 100 |
| 47.55768654480072 | 100 |
| 47.587653581060835 | 100 |
| 47.61762061732095 | 100 |
| 47.647587653581056 | 100 |
| 47.67755468984117 | 100 |
| 47.70752172610129 | 100 |
| 47.7374887623614 | 100 |
| 47.76745579862152 | 100 |
| 47.79742283488163 | 100 |
| 47.82738987114175 | 100 |
| 47.85735690740186 | 100 |
| 47.88732394366197 | 100 |
| 47.917290979922086 | 100 |
| 47.9472580161822 | 100 |
| 47.977225052442314 | 100 |
| 48.007192088702425 | 100 |
| 48.03715912496254 | 100 |
| 48.06712616122265 | 100 |
| 48.09709319748277 | 100 |
| 48.12706023374289 | 100 |
| 48.15702727000299 | 100 |
| 48.18699430626311 | 100 |
| 48.21696134252322 | 100 |
| 48.24692837878334 | 100 |
| 48.276895415043455 | 100 |
| 48.306862451303566 | 100 |
| 48.33682948756368 | 100 |
| 48.366796523823794 | 100 |
| 48.396763560083905 | 100 |
| 48.42673059634402 | 100 |
| 48.45669763260413 | 100 |
| 48.48666466886425 | 100 |
| 48.51663170512436 | 100 |
| 48.54659874138448 | 100 |
| 48.57656577764459 | 100 |
| 48.60653281390471 | 100 |
| 48.63649985016482 | 100 |
| 48.66646688642493 | 100 |
| 48.696433922685046 | 100 |
| 48.72640095894516 | 100 |
| 48.756367995205274 | 100 |
| 48.78633503146539 | 100 |
| 48.8163020677255 | 100 |
| 48.84626910398562 | 100 |
| 48.87623614024573 | 100 |
| 48.90620317650584 | 100 |
| 48.93617021276596 | 100 |
| 48.96613724902607 | 100 |
| 48.99610428528619 | 100 |
| 49.0260713215463 | 100 |
| 49.056038357806415 | 100 |
| 49.086005394066525 | 100 |
| 49.11597243032664 | 100 |
| 49.14593946658675 | 100 |
| 49.175906502846864 | 100 |
| 49.20587353910698 | 100 |
| 49.23584057536709 | 100 |
| 49.26580761162721 | 100 |
| 49.29577464788733 | 100 |
| 49.32574168414744 | 100 |
| 49.355708720407556 | 100 |
| 49.385675756667666 | 100 |
| 49.41564279292778 | 100 |
| 49.445609829187894 | 100 |
| 49.475576865448005 | 100 |
| 49.50554390170812 | 100 |
| 49.53551093796823 | 100 |
| 49.56547797422835 | 100 |
| 49.59544501048846 | 100 |
| 49.62541204674858 | 100 |
| 49.65537908300869 | 100 |
| 49.6853461192688 | 100 |
| 49.71531315552892 | 100 |
| 49.745280191789035 | 100 |
| 49.775247228049146 | 100 |
| 49.805214264309264 | 100 |
| 49.835181300569374 | 100 |
| 49.86514833682949 | 100 |
| 49.8951153730896 | 100 |
| 49.92508240934971 | 100 |
| 49.95504944560983 | 100 |
| 49.98501648186994 | 100 |
| 50.01498351813005 | 100 |
| 50.04495055439017 | 100 |
| 50.07491759065028 | 100 |
| 50.1048846269104 | 100 |
| 50.13485166317051 | 100 |
| 50.164818699430626 | 100 |
| 50.194785735690736 | 100 |
| 50.224752771950854 | 100 |
| 50.254719808210965 | 100 |
| 50.28468684447108 | 100 |
| 50.3146538807312 | 100 |
| 50.34462091699131 | 100 |
| 50.37458795325143 | 100 |
| 50.40455498951154 | 100 |
| 50.434522025771656 | 100 |
| 50.46448906203177 | 100 |
| 50.494456098291884 | 100 |
| 50.52442313455199 | 100 |
| 50.554390170812106 | 100 |
| 50.584357207072216 | 100 |
| 50.614324243332334 | 100 |
| 50.644291279592444 | 100 |
| 50.67425831585256 | 100 |
| 50.70422535211267 | 100 |
| 50.73419238837279 | 100 |
| 50.76415942463291 | 100 |
| 50.79412646089302 | 100 |
| 50.824093497153136 | 100 |
| 50.85406053341325 | 100 |
| 50.884027569673364 | 100 |
| 50.913994605933475 | 100 |
| 50.94396164219359 | 100 |
| 50.9739286784537 | 100 |
| 51.003895714713806 | 100 |
| 51.033862750973924 | 100 |
| 51.06382978723404 | 100 |
| 51.09379682349415 | 100 |
| 51.12376385975427 | 100 |
| 51.15373089601438 | 100 |
| 51.1836979322745 | 100 |
| 51.21366496853461 | 100 |
| 51.243632004794726 | 100 |
| 51.27359904105484 | 100 |
| 51.303566077314954 | 100 |
| 51.33353311357507 | 100 |
| 51.36350014983518 | 100 |
| 51.3934671860953 | 100 |
| 51.42343422235541 | 100 |
| 51.45340125861553 | 100 |
| 51.48336829487564 | 100 |
| 51.51333533113574 | 100 |
| 51.54330236739586 | 100 |
| 51.57326940365598 | 100 |
| 51.60323643991609 | 100 |
| 51.633203476176206 | 100 |
| 51.66317051243632 | 100 |
| 51.693137548696434 | 100 |
| 51.723104584956545 | 100 |
| 51.75307162121666 | 100 |
| 51.78303865747678 | 100 |
| 51.81300569373689 | 100 |
| 51.84297272999701 | 100 |
| 51.87293976625712 | 100 |
| 51.902906802517236 | 100 |
| 51.93287383877735 | 100 |
| 51.962840875037465 | 100 |
| 51.99280791129757 | 100 |
| 52.02277494755768 | 100 |
| 52.052741983817796 | 100 |
| 52.082709020077914 | 100 |
| 52.112676056338024 | 100 |
| 52.14264309259814 | 100 |
| 52.17261012885825 | 100 |
| 52.20257716511837 | 100 |
| 52.23254420137848 | 100 |
| 52.2625112376386 | 100 |
| 52.29247827389871 | 100 |
| 52.32244531015883 | 100 |
| 52.352412346418944 | 100 |
| 52.382379382679055 | 100 |
| 52.41234641893917 | 100 |
| 52.44231345519928 | 100 |
| 52.4722804914594 | 100 |
| 52.502247527719504 | 100 |
| 52.532214563979615 | 100 |
| 52.56218160023973 | 100 |
| 52.59214863649985 | 100 |
| 52.62211567275996 | 100 |
| 52.65208270902008 | 100 |
| 52.68204974528019 | 100 |
| 52.71201678154031 | 100 |
| 52.74198381780042 | 100 |
| 52.771950854060535 | 100 |
| 52.80191789032065 | 100 |
| 52.83188492658076 | 100 |
| 52.86185196284088 | 100 |
| 52.89181899910099 | 100 |
| 52.92178603536111 | 100 |
| 52.95175307162122 | 100 |
| 52.98172010788134 | 100 |
| 53.01168714414144 | 100 |
| 53.04165418040155 | 100 |
| 53.07162121666167 | 100 |
| 53.101588252921786 | 100 |
| 53.1315552891819 | 100 |
| 53.161522325442014 | 100 |
| 53.191489361702125 | 100 |
| 53.22145639796224 | 100 |
| 53.25142343422235 | 100 |
| 53.28139047048247 | 100 |
| 53.31135750674258 | 100 |
| 53.3413245430027 | 100 |
| 53.37129157926282 | 100 |
| 53.40125861552293 | 100 |
| 53.431225651783045 | 100 |
| 53.461192688043155 | 100 |
| 53.49115972430326 | 100 |
| 53.52112676056338 | 100 |
| 53.55109379682349 | 100 |
| 53.581060833083605 | 100 |
| 53.61102786934372 | 100 |
| 53.64099490560383 | 100 |
| 53.67096194186395 | 100 |
| 53.70092897812406 | 100 |
| 53.73089601438418 | 100 |
| 53.76086305064429 | 100 |
| 53.79083008690441 | 100 |
| 53.820797123164525 | 100 |
| 53.850764159424635 | 100 |
| 53.88073119568475 | 100 |
| 53.91069823194486 | 100 |
| 53.94066526820498 | 100 |
| 53.97063230446509 | 100 |
| 54.000599340725195 | 100 |
| 54.03056637698531 | 100 |
| 54.06053341324542 | 100 |
| 54.09050044950554 | 100 |
| 54.12046748576566 | 100 |
| 54.15043452202577 | 100 |
| 54.18040155828589 | 100 |
| 54.210368594546 | 100 |
| 54.240335630806115 | 100 |
| 54.270302667066225 | 100 |
| 54.30026970332634 | 100 |
| 54.330236739586454 | 100 |
| 54.36020377584657 | 100 |
| 54.39017081210669 | 100 |
| 54.4201378483668 | 100 |
| 54.45010488462692 | 100 |
| 54.48007192088702 | 100 |
| 54.51003895714713 | 100 |
| 54.54000599340725 | 100 |
| 54.56997302966736 | 100 |
| 54.59994006592748 | 100 |
| 54.629907102187595 | 100 |
| 54.659874138447705 | 100 |
| 54.68984117470782 | 100 |
| 54.71980821096793 | 100 |
| 54.74977524722805 | 100 |
| 54.77974228348816 | 100 |
| 54.80970931974828 | 100 |
| 54.8396763560084 | 100 |
| 54.86964339226851 | 100 |
| 54.899610428528625 | 100 |
| 54.929577464788736 | 100 |
| 54.95954450104885 | 100 |
| 54.98951153730896 | 100 |
| 55.01947857356907 | 100 |
| 55.049445609829185 | 100 |
| 55.079412646089295 | 100 |
| 55.10937968234941 | 100 |
| 55.13934671860953 | 100 |
| 55.16931375486964 | 100 |
| 55.19928079112976 | 100 |
| 55.22924782738987 | 100 |
| 55.25921486364999 | 100 |
| 55.2891818999101 | 100 |
| 55.319148936170215 | 100 |
| 55.349115972430326 | 100 |
| 55.37908300869044 | 100 |
| 55.40905004495056 | 100 |
| 55.43901708121067 | 100 |
| 55.46898411747079 | 100 |
| 55.49895115373089 | 100 |
| 55.528918189991 | 100 |
| 55.55888522625112 | 100 |
| 55.58885226251123 | 100 |
| 55.61881929877135 | 100 |
| 55.64878633503147 | 100 |
| 55.67875337129158 | 100 |
| 55.708720407551695 | 100 |
| 55.738687443811806 | 100 |
| 55.76865448007192 | 100 |
| 55.798621516332034 | 100 |
| 55.82858855259215 | 100 |
| 55.85855558885227 | 100 |
| 55.88852262511238 | 100 |
| 55.9184896613725 | 100 |
| 55.94845669763261 | 100 |
| 55.97842373389271 | 100 |
| 56.00839077015283 | 100 |
| 56.03835780641294 | 100 |
| 56.06832484267306 | 100 |
| 56.09829187893317 | 100 |
| 56.128258915193285 | 100 |
| 56.1582259514534 | 100 |
| 56.188192987713514 | 100 |
| 56.21816002397363 | 100 |
| 56.24812706023374 | 100 |
| 56.27809409649386 | 100 |
| 56.30806113275397 | 100 |
| 56.33802816901409 | 100 |
| 56.3679952052742 | 100 |
| 56.397962241534316 | 100 |
| 56.42792927779443 | 100 |
| 56.457896314054544 | 100 |
| 56.48786335031465 | 100 |
| 56.517830386574765 | 100 |
| 56.547797422834876 | 100 |
| 56.57776445909499 | 100 |
| 56.607731495355104 | 100 |
| 56.63769853161522 | 100 |
| 56.66766556787534 | 100 |
| 56.69763260413545 | 100 |
| 56.72759964039557 | 100 |
| 56.75756667665568 | 100 |
| 56.787533712915796 | 100 |
| 56.817500749175906 | 100 |
| 56.847467785436024 | 100 |
| 56.87743482169614 | 100 |
| 56.90740185795625 | 100 |
| 56.93736889421637 | 100 |
| 56.96733593047647 | 100 |
| 56.997302966736584 | 100 |
| 57.0272700029967 | 100 |
| 57.05723703925681 | 100 |
| 57.08720407551693 | 100 |
| 57.11717111177704 | 100 |
| 57.14713814803716 | 100 |
| 57.177105184297275 | 100 |
| 57.207072220557386 | 100 |
| 57.2370392568175 | 100 |
| 57.267006293077614 | 100 |
| 57.29697332933773 | 100 |
| 57.32694036559784 | 100 |
| 57.35690740185796 | 100 |
| 57.38687443811807 | 100 |
| 57.41684147437819 | 100 |
| 57.446808510638306 | 100 |
| 57.47677554689841 | 100 |
| 57.50674258315852 | 100 |
| 57.53670961941864 | 100 |
| 57.56667665567875 | 100 |
| 57.596643691938866 | 100 |
| 57.626610728198976 | 100 |
| 57.656577764459094 | 100 |
| 57.68654480071921 | 100 |
| 57.71651183697932 | 100 |
| 57.74647887323944 | 100 |
| 57.77644590949955 | 100 |
| 57.80641294575967 | 100 |
| 57.83637998201978 | 100 |
| 57.866347018279896 | 100 |
| 57.896314054540014 | 100 |
| 57.926281090800124 | 100 |
| 57.95624812706024 | 100 |
| 57.986215163320345 | 100 |
| 58.016182199580456 | 100 |
| 58.04614923584057 | 100 |
| 58.076116272100684 | 100 |
| 58.1060833083608 | 100 |
| 58.13605034462091 | 100 |
| 58.16601738088103 | 100 |
| 58.19598441714115 | 100 |
| 58.22595145340126 | 100 |
| 58.255918489661376 | 100 |
| 58.285885525921486 | 100 |
| 58.315852562181604 | 100 |
| 58.345819598441715 | 100 |
| 58.37578663470183 | 100 |
| 58.40575367096194 | 100 |
| 58.43572070722206 | 100 |
| 58.465687743482164 | 100 |
| 58.49565477974228 | 100 |
| 58.52562181600239 | 100 |
| 58.55558885226251 | 100 |
| 58.58555588852262 | 100 |
| 58.61552292478274 | 100 |
| 58.64548996104285 | 100 |
| 58.675456997302966 | 100 |
| 58.705424033563084 | 100 |
| 58.735391069823194 | 100 |
| 58.76535810608331 | 100 |
| 58.79532514234342 | 100 |
| 58.82529217860354 | 100 |
| 58.85525921486365 | 100 |
| 58.88522625112377 | 100 |
| 58.915193287383886 | 100 |
| 58.945160323644 | 100 |
| 58.9751273599041 | 100 |
| 59.00509439616422 | 100 |
| 59.03506143242433 | 100 |
| 59.065028468684446 | 100 |
| 59.094995504944556 | 100 |
| 59.124962541204674 | 100 |
| 59.154929577464785 | 100 |
| 59.1848966137249 | 100 |
| 59.21486364998502 | 100 |
| 59.24483068624513 | 100 |
| 59.27479772250525 | 100 |
| 59.30476475876536 | 100 |
| 59.334731795025476 | 100 |
| 59.36469883128559 | 100 |
| 59.394665867545704 | 100 |
| 59.424632903805815 | 100 |
| 59.45459994006592 | 100 |
| 59.484566976326036 | 100 |
| 59.514534012586154 | 100 |
| 59.544501048846264 | 100 |
| 59.57446808510638 | 100 |
| 59.60443512136649 | 100 |
| 59.63440215762661 | 100 |
| 59.66436919388672 | 100 |
| 59.69433623014684 | 100 |
| 59.724303266406956 | 100 |
| 59.75427030266707 | 100 |
| 59.784237338927184 | 100 |
| 59.814204375187295 | 100 |
| 59.84417141144741 | 100 |
| 59.87413844770752 | 100 |
| 59.90410548396764 | 100 |
| 59.93407252022776 | 100 |
| 59.96403955648786 | 100 |
| 59.99400659274797 | 100 |
| 60.02397362900809 | 100 |
| 60.0539406652682 | 100 |
| 60.08390770152832 | 100 |
| 60.11387473778843 | 100 |
| 60.143841774048546 | 100 |
| 60.17380881030866 | 100 |
| 60.203775846568774 | 100 |
| 60.23374288282889 | 100 |
| 60.263709919089 | 100 |
| 60.29367695534912 | 100 |
| 60.32364399160923 | 100 |
| 60.35361102786935 | 100 |
| 60.38357806412946 | 100 |
| 60.41354510038958 | 100 |
| 60.44351213664969 | 100 |
| 60.47347917290979 | 100 |
| 60.50344620916991 | 100 |
| 60.533413245430026 | 100 |
| 60.56338028169014 | 100 |
| 60.593347317950254 | 100 |
| 60.623314354210365 | 100 |
| 60.65328139047048 | 100 |
| 60.68324842673059 | 100 |
| 60.71321546299071 | 100 |
| 60.74318249925083 | 100 |
| 60.77314953551094 | 100 |
| 60.803116571771056 | 100 |
| 60.83308360803117 | 100 |
| 60.863050644291285 | 100 |
| 60.893017680551395 | 100 |
| 60.92298471681151 | 100 |
| 60.952951753071616 | 100 |
| 60.982918789331734 | 100 |
| 61.012885825591844 | 100 |
| 61.04285286185196 | 100 |
| 61.07281989811207 | 100 |
| 61.10278693437219 | 100 |
| 61.1327539706323 | 100 |
| 61.16272100689242 | 100 |
| 61.19268804315253 | 100 |
| 61.22265507941265 | 100 |
| 61.252622115672764 | 100 |
| 61.282589151932875 | 100 |
| 61.31255618819299 | 100 |
| 61.3425232244531 | 100 |
| 61.37249026071322 | 100 |
| 61.40245729697333 | 100 |
| 61.43242433323345 | 100 |
| 61.46239136949355 | 100 |
| 61.49235840575366 | 100 |
| 61.52232544201378 | 100 |
| 61.5522924782739 | 100 |
| 61.58225951453401 | 100 |
| 61.61222655079413 | 100 |
| 61.64219358705424 | 100 |
| 61.672160623314355 | 100 |
| 61.702127659574465 | 100 |
| 61.73209469583458 | 100 |
| 61.7620617320947 | 100 |
| 61.79202876835481 | 100 |
| 61.82199580461493 | 100 |
| 61.85196284087504 | 100 |
| 61.88192987713516 | 100 |
| 61.91189691339527 | 100 |
| 61.94186394965537 | 100 |
| 61.97183098591549 | 100 |
| 62.001798022175606 | 100 |
| 62.03176505843572 | 100 |
| 62.061732094695834 | 100 |
| 62.091699130955945 | 100 |
| 62.12166616721606 | 100 |
| 62.15163320347617 | 100 |
| 62.18160023973629 | 100 |
| 62.2115672759964 | 100 |
| 62.24153431225652 | 100 |
| 62.27150134851664 | 100 |
| 62.30146838477675 | 100 |
| 62.331435421036865 | 100 |
| 62.361402457296975 | 100 |
| 62.39136949355709 | 100 |
| 62.421336529817204 | 100 |
| 62.45130356607731 | 100 |
| 62.481270602337425 | 100 |
| 62.511237638597535 | 100 |
| 62.54120467485765 | 100 |
| 62.57117171111777 | 100 |
| 62.60113874737788 | 100 |
| 62.631105783638 | 100 |
| 62.66107281989811 | 100 |
| 62.69103985615823 | 100 |
| 62.72100689241834 | 100 |
| 62.750973928678455 | 100 |
| 62.78094096493857 | 100 |
| 62.81090800119868 | 100 |
| 62.8408750374588 | 100 |
| 62.87084207371891 | 100 |
| 62.90080910997903 | 100 |
| 62.93077614623914 | 100 |
| 62.96074318249924 | 100 |
| 62.99071021875936 | 100 |
| 63.02067725501948 | 100 |
| 63.05064429127959 | 100 |
| 63.08061132753971 | 100 |
| 63.11057836379982 | 100 |
| 63.140545400059935 | 100 |
| 63.170512436320045 | 100 |
| 63.20047947258016 | 100 |
| 63.230446508840274 | 100 |
| 63.26041354510039 | 100 |
| 63.29038058136051 | 100 |
| 63.32034761762062 | 100 |
| 63.35031465388074 | 100 |
| 63.38028169014085 | 100 |
| 63.410248726400965 | 100 |
| 63.44021576266107 | 100 |
| 63.47018279892118 | 100 |
| 63.5001498351813 | 100 |
| 63.53011687144141 | 100 |
| 63.560083907701525 | 100 |
| 63.59005094396164 | 100 |
| 63.62001798022175 | 100 |
| 63.64998501648187 | 100 |
| 63.67995205274198 | 100 |
| 63.7099190890021 | 100 |
| 63.73988612526221 | 100 |
| 63.76985316152233 | 100 |
| 63.799820197782445 | 100 |
| 63.829787234042556 | 100 |
| 63.85975427030267 | 100 |
| 63.889721306562784 | 100 |
| 63.9196883428229 | 100 |
| 63.949655379083005 | 100 |
| 63.979622415343115 | 100 |
| 64.00958945160323 | 100 |
| 64.03955648786335 | 100 |
| 64.06952352412347 | 100 |
| 64.09949056038357 | 100 |
| 64.12945759664369 | 100 |
| 64.15942463290381 | 100 |
| 64.18939166916392 | 100 |
| 64.21935870542403 | 100 |
| 64.24932574168415 | 100 |
| 64.27929277794426 | 100 |
| 64.30925981420438 | 100 |
| 64.3392268504645 | 100 |
| 64.3691938867246 | 100 |
| 64.39916092298472 | 100 |
| 64.42912795924482 | 100 |
| 64.45909499550494 | 100 |
| 64.48906203176506 | 100 |
| 64.51902906802516 | 100 |
| 64.54899610428528 | 100 |
| 64.5789631405454 | 100 |
| 64.60893017680552 | 100 |
| 64.63889721306563 | 100 |
| 64.66886424932574 | 100 |
| 64.69883128558585 | 100 |
| 64.72879832184597 | 100 |
| 64.75876535810609 | 100 |
| 64.7887323943662 | 100 |
| 64.81869943062631 | 100 |
| 64.84866646688643 | 100 |
| 64.87863350314655 | 100 |
| 64.90860053940666 | 100 |
| 64.93856757566677 | 100 |
| 64.96853461192687 | 100 |
| 64.99850164818699 | 100 |
| 65.0284686844471 | 100 |
| 65.05843572070722 | 100 |
| 65.08840275696734 | 100 |
| 65.11836979322744 | 100 |
| 65.14833682948756 | 100 |
| 65.17830386574768 | 100 |
| 65.2082709020078 | 100 |
| 65.2382379382679 | 100 |
| 65.26820497452802 | 100 |
| 65.29817201078814 | 100 |
| 65.32813904704825 | 100 |
| 65.35810608330837 | 100 |
| 65.38807311956847 | 100 |
| 65.41804015582859 | 100 |
| 65.4480071920887 | 100 |
| 65.47797422834881 | 100 |
| 65.50794126460893 | 100 |
| 65.53790830086903 | 100 |
| 65.56787533712915 | 100 |
| 65.59784237338927 | 100 |
| 65.62780940964939 | 100 |
| 65.6577764459095 | 100 |
| 65.68774348216961 | 100 |
| 65.71771051842973 | 100 |
| 65.74767755468984 | 100 |
| 65.77764459094996 | 100 |
| 65.80761162721006 | 100 |
| 65.83757866347018 | 100 |
| 65.8675456997303 | 100 |
| 65.89751273599042 | 100 |
| 65.92747977225052 | 100 |
| 65.95744680851064 | 100 |
| 65.98741384477074 | 100 |
| 66.01738088103086 | 100 |
| 66.04734791729098 | 100 |
| 66.0773149535511 | 100 |
| 66.10728198981121 | 100 |
| 66.13724902607132 | 100 |
| 66.16721606233143 | 100 |
| 66.19718309859155 | 100 |
| 66.22715013485167 | 100 |
| 66.25711717111177 | 100 |
| 66.28708420737189 | 100 |
| 66.31705124363201 | 100 |
| 66.34701827989213 | 100 |
| 66.37698531615224 | 100 |
| 66.40695235241235 | 100 |
| 66.43691938867245 | 100 |
| 66.46688642493257 | 100 |
| 66.49685346119269 | 100 |
| 66.5268204974528 | 100 |
| 66.5567875337129 | 100 |
| 66.58675456997302 | 100 |
| 66.61672160623314 | 100 |
| 66.64668864249326 | 100 |
| 66.67665567875338 | 100 |
| 66.70662271501348 | 100 |
| 66.7365897512736 | 100 |
| 66.76655678753372 | 100 |
| 66.79652382379383 | 100 |
| 66.82649086005395 | 100 |
| 66.85645789631405 | 100 |
| 66.88642493257417 | 100 |
| 66.91639196883428 | 100 |
| 66.9463590050944 | 100 |
| 66.97632604135451 | 100 |
| 67.00629307761461 | 100 |
| 67.03626011387473 | 100 |
| 67.06622715013485 | 100 |
| 67.09619418639497 | 100 |
| 67.12616122265509 | 100 |
| 67.15612825891519 | 100 |
| 67.1860952951753 | 100 |
| 67.21606233143542 | 100 |
| 67.24602936769554 | 100 |
| 67.27599640395565 | 100 |
| 67.30596344021576 | 100 |
| 67.33593047647588 | 100 |
| 67.365897512736 | 100 |
| 67.39586454899612 | 100 |
| 67.42583158525622 | 100 |
| 67.45579862151632 | 100 |
| 67.48576565777644 | 100 |
| 67.51573269403656 | 100 |
| 67.54569973029668 | 100 |
| 67.57566676655678 | 100 |
| 67.6056338028169 | 100 |
| 67.63560083907701 | 100 |
| 67.66556787533713 | 100 |
| 67.69553491159725 | 100 |
| 67.72550194785735 | 100 |
| 67.75546898411747 | 100 |
| 67.78543602037759 | 100 |
| 67.8154030566377 | 100 |
| 67.84537009289781 | 100 |
| 67.87533712915793 | 100 |
| 67.90530416541804 | 100 |
| 67.93527120167815 | 100 |
| 67.96523823793827 | 100 |
| 67.99520527419838 | 100 |
| 68.02517231045849 | 100 |
| 68.0551393467186 | 100 |
| 68.08510638297872 | 100 |
| 68.11507341923884 | 100 |
| 68.14504045549896 | 100 |
| 68.17500749175906 | 100 |
| 68.20497452801918 | 100 |
| 68.2349415642793 | 100 |
| 68.26490860053941 | 100 |
| 68.29487563679952 | 100 |
| 68.32484267305963 | 100 |
| 68.35480970931975 | 100 |
| 68.38477674557987 | 100 |
| 68.41474378183997 | 100 |
| 68.44471081810009 | 100 |
| 68.4746778543602 | 100 |
| 68.50464489062031 | 100 |
| 68.53461192688043 | 100 |
| 68.56457896314055 | 100 |
| 68.59454599940065 | 100 |
| 68.62451303566077 | 100 |
| 68.65448007192089 | 100 |
| 68.684447108181 | 100 |
| 68.71441414444112 | 100 |
| 68.74438118070123 | 100 |
| 68.77434821696134 | 100 |
| 68.80431525322146 | 100 |
| 68.83428228948158 | 100 |
| 68.8642493257417 | 100 |
| 68.8942163620018 | 100 |
| 68.9241833982619 | 100 |
| 68.95415043452202 | 100 |
| 68.98411747078214 | 100 |
| 69.01408450704226 | 100 |
| 69.04405154330236 | 100 |
| 69.07401857956248 | 100 |
| 69.1039856158226 | 100 |
| 69.13395265208271 | 100 |
| 69.16391968834283 | 100 |
| 69.19388672460293 | 100 |
| 69.22385376086305 | 100 |
| 69.25382079712317 | 100 |
| 69.28378783338329 | 100 |
| 69.31375486964339 | 100 |
| 69.34372190590351 | 100 |
| 69.37368894216362 | 100 |
| 69.40365597842373 | 100 |
| 69.43362301468385 | 100 |
| 69.46359005094396 | 100 |
| 69.49355708720407 | 100 |
| 69.52352412346418 | 100 |
| 69.5534911597243 | 100 |
| 69.58345819598442 | 100 |
| 69.61342523224452 | 100 |
| 69.64339226850464 | 100 |
| 69.67335930476476 | 100 |
| 69.70332634102488 | 100 |
| 69.733293377285 | 100 |
| 69.7632604135451 | 100 |
| 69.79322744980522 | 100 |
| 69.82319448606533 | 100 |
| 69.85316152232545 | 100 |
| 69.88312855858555 | 100 |
| 69.91309559484566 | 100 |
| 69.94306263110578 | 100 |
| 69.97302966736589 | 100 |
| 70.00299670362601 | 100 |
| 70.03296373988613 | 100 |
| 70.06293077614623 | 100 |
| 70.09289781240635 | 100 |
| 70.12286484866647 | 100 |
| 70.15283188492658 | 100 |
| 70.1827989211867 | 100 |
| 70.2127659574468 | 100 |
| 70.24273299370692 | 100 |
| 70.27270002996704 | 100 |
| 70.30266706622716 | 100 |
| 70.33263410248726 | 100 |
| 70.36260113874738 | 100 |
| 70.3925681750075 | 100 |
| 70.4225352112676 | 100 |
| 70.45250224752772 | 100 |
| 70.48246928378784 | 100 |
| 70.51243632004794 | 100 |
| 70.54240335630806 | 100 |
| 70.57237039256817 | 100 |
| 70.60233742882829 | 100 |
| 70.6323044650884 | 100 |
| 70.66227150134851 | 100 |
| 70.69223853760863 | 100 |
| 70.72220557386875 | 100 |
| 70.75217261012887 | 100 |
| 70.78213964638897 | 100 |
| 70.81210668264909 | 100 |
| 70.8420737189092 | 100 |
| 70.87204075516932 | 100 |
| 70.90200779142943 | 100 |
| 70.93197482768954 | 100 |
| 70.96194186394965 | 100 |
| 70.99190890020976 | 100 |
| 71.02187593646988 | 100 |
| 71.05184297273 | 100 |
| 71.0818100089901 | 100 |
| 71.11177704525022 | 100 |
| 71.14174408151034 | 100 |
| 71.17171111777046 | 100 |
| 71.20167815403057 | 100 |
| 71.23164519029068 | 100 |
| 71.2616122265508 | 100 |
| 71.29157926281091 | 100 |
| 71.32154629907103 | 100 |
| 71.35151333533113 | 100 |
| 71.38148037159125 | 100 |
| 71.41144740785136 | 100 |
| 71.44141444411147 | 100 |
| 71.47138148037159 | 100 |
| 71.50134851663171 | 100 |
| 71.53131555289181 | 100 |
| 71.56128258915193 | 100 |
| 71.59124962541205 | 100 |
| 71.62121666167216 | 100 |
| 71.65118369793227 | 100 |
| 71.68115073419239 | 100 |
| 71.7111177704525 | 100 |
| 71.74108480671262 | 100 |
| 71.77105184297274 | 100 |
| 71.80101887923284 | 100 |
| 71.83098591549296 | 100 |
| 71.86095295175308 | 100 |
| 71.89091998801318 | 100 |
| 71.9208870242733 | 100 |
| 71.9508540605334 | 100 |
| 71.98082109679352 | 100 |
| 72.01078813305364 | 100 |
| 72.04075516931375 | 100 |
| 72.07072220557387 | 100 |
| 72.10068924183398 | 100 |
| 72.1306562780941 | 100 |
| 72.16062331435421 | 100 |
| 72.19059035061433 | 100 |
| 72.22055738687445 | 100 |
| 72.25052442313455 | 100 |
| 72.28049145939467 | 100 |
| 72.31045849565479 | 100 |
| 72.3404255319149 | 100 |
| 72.370392568175 | 100 |
| 72.40035960443511 | 100 |
| 72.43032664069523 | 100 |
| 72.46029367695535 | 100 |
| 72.49026071321546 | 100 |
| 72.52022774947558 | 100 |
| 72.55019478573568 | 100 |
| 72.5801618219958 | 100 |
| 72.61012885825592 | 100 |
| 72.64009589451604 | 100 |
| 72.67006293077614 | 100 |
| 72.70002996703626 | 100 |
| 72.72999700329638 | 100 |
| 72.7599640395565 | 100 |
| 72.78993107581661 | 100 |
| 72.81989811207671 | 100 |
| 72.84986514833683 | 100 |
| 72.87983218459695 | 100 |
| 72.90979922085705 | 100 |
| 72.93976625711717 | 100 |
| 72.96973329337729 | 100 |
| 72.99970032963739 | 100 |
| 73.02966736589751 | 100 |
| 73.05963440215763 | 100 |
| 73.08960143841774 | 100 |
| 73.11956847467785 | 100 |
| 73.14953551093797 | 100 |
| 73.17950254719808 | 100 |
| 73.2094695834582 | 100 |
| 73.23943661971832 | 100 |
| 73.26940365597842 | 100 |
| 73.29937069223854 | 100 |
| 73.32933772849866 | 100 |
| 73.35930476475878 | 100 |
| 73.38927180101888 | 100 |
| 73.41923883727898 | 100 |
| 73.4492058735391 | 100 |
| 73.47917290979922 | 100 |
| 73.50913994605934 | 100 |
| 73.53910698231945 | 100 |
| 73.56907401857956 | 100 |
| 73.59904105483967 | 100 |
| 73.62900809109979 | 100 |
| 73.65897512735991 | 100 |
| 73.68894216362001 | 100 |
| 73.71890919988013 | 100 |
| 73.74887623614025 | 100 |
| 73.77884327240037 | 100 |
| 73.80881030866048 | 100 |
| 73.83877734492059 | 100 |
| 73.8687443811807 | 100 |
| 73.89871141744081 | 100 |
| 73.92867845370093 | 100 |
| 73.95864548996104 | 100 |
| 73.98861252622115 | 100 |
| 74.01857956248126 | 100 |
| 74.04854659874138 | 100 |
| 74.0785136350015 | 100 |
| 74.10848067126162 | 100 |
| 74.13844770752172 | 100 |
| 74.16841474378184 | 100 |
| 74.19838178004196 | 100 |
| 74.22834881630207 | 100 |
| 74.25831585256219 | 100 |
| 74.2882828888223 | 100 |
| 74.31824992508241 | 100 |
| 74.34821696134253 | 100 |
| 74.37818399760263 | 100 |
| 74.40815103386275 | 100 |
| 74.43811807012285 | 100 |
| 74.46808510638297 | 100 |
| 74.49805214264309 | 100 |
| 74.52801917890321 | 100 |
| 74.55798621516333 | 100 |
| 74.58795325142343 | 100 |
| 74.61792028768355 | 100 |
| 74.64788732394366 | 100 |
| 74.67785436020378 | 100 |
| 74.70782139646388 | 100 |
| 74.737788432724 | 100 |
| 74.76775546898412 | 100 |
| 74.79772250524424 | 100 |
| 74.82768954150436 | 100 |
| 74.85765657776446 | 100 |
| 74.88762361402456 | 100 |
| 74.91759065028468 | 100 |
| 74.9475576865448 | 100 |
| 74.97752472280492 | 100 |
| 75.00749175906503 | 100 |
| 75.03745879532514 | 100 |
| 75.06742583158525 | 100 |
| 75.09739286784537 | 100 |
| 75.12735990410549 | 100 |
| 75.15732694036559 | 100 |
| 75.18729397662571 | 100 |
| 75.21726101288583 | 100 |
| 75.24722804914595 | 100 |
| 75.27719508540606 | 100 |
| 75.30716212166617 | 100 |
| 75.33712915792628 | 100 |
| 75.3670961941864 | 100 |
| 75.3970632304465 | 100 |
| 75.42703026670662 | 100 |
| 75.45699730296673 | 100 |
| 75.48696433922684 | 100 |
| 75.51693137548696 | 100 |
| 75.54689841174708 | 100 |
| 75.5768654480072 | 100 |
| 75.6068324842673 | 100 |
| 75.63679952052742 | 100 |
| 75.66676655678754 | 100 |
| 75.69673359304765 | 100 |
| 75.72670062930776 | 100 |
| 75.75666766556787 | 100 |
| 75.78663470182799 | 100 |
| 75.81660173808811 | 100 |
| 75.84656877434823 | 100 |
| 75.87653581060833 | 100 |
| 75.90650284686843 | 100 |
| 75.93646988312855 | 100 |
| 75.96643691938867 | 100 |
| 75.99640395564879 | 100 |
| 76.02637099190889 | 100 |
| 76.05633802816901 | 100 |
| 76.08630506442913 | 100 |
| 76.11627210068924 | 100 |
| 76.14623913694936 | 100 |
| 76.17620617320947 | 100 |
| 76.20617320946958 | 100 |
| 76.2361402457297 | 100 |
| 76.26610728198982 | 100 |
| 76.29607431824994 | 100 |
| 76.32604135451004 | 100 |
| 76.35600839077016 | 100 |
| 76.38597542703026 | 100 |
| 76.41594246329038 | 100 |
| 76.4459094995505 | 100 |
| 76.4758765358106 | 100 |
| 76.50584357207072 | 100 |
| 76.53581060833083 | 100 |
| 76.56577764459095 | 100 |
| 76.59574468085107 | 100 |
| 76.62571171711117 | 100 |
| 76.65567875337129 | 100 |
| 76.68564578963141 | 100 |
| 76.71561282589153 | 100 |
| 76.74557986215163 | 100 |
| 76.77554689841175 | 100 |
| 76.80551393467186 | 100 |
| 76.83548097093198 | 100 |
| 76.8654480071921 | 100 |
| 76.8954150434522 | 100 |
| 76.9253820797123 | 100 |
| 76.95534911597242 | 100 |
| 76.98531615223254 | 100 |
| 77.01528318849266 | 100 |
| 77.04525022475278 | 100 |
| 77.07521726101288 | 100 |
| 77.105184297273 | 100 |
| 77.13515133353312 | 100 |
| 77.16511836979323 | 100 |
| 77.19508540605334 | 100 |
| 77.22505244231346 | 100 |
| 77.25501947857357 | 100 |
| 77.28498651483369 | 100 |
| 77.31495355109381 | 100 |
| 77.34492058735391 | 100 |
| 77.37488762361401 | 100 |
| 77.40485465987413 | 100 |
| 77.43482169613425 | 100 |
| 77.46478873239437 | 100 |
| 77.49475576865447 | 100 |
| 77.52472280491459 | 100 |
| 77.5546898411747 | 100 |
| 77.58465687743482 | 100 |
| 77.61462391369494 | 100 |
| 77.64459094995505 | 100 |
| 77.67455798621516 | 100 |
| 77.70452502247528 | 100 |
| 77.7344920587354 | 100 |
| 77.7644590949955 | 100 |
| 77.79442613125562 | 100 |
| 77.82439316751574 | 100 |
| 77.85436020377585 | 100 |
| 77.88432724003596 | 100 |
| 77.91429427629608 | 100 |
| 77.94426131255618 | 100 |
| 77.9742283488163 | 100 |
| 78.00419538507641 | 100 |
| 78.03416242133653 | 100 |
| 78.06412945759664 | 100 |
| 78.09409649385675 | 100 |
| 78.12406353011687 | 100 |
| 78.15403056637699 | 100 |
| 78.1839976026371 | 100 |
| 78.21396463889721 | 100 |
| 78.24393167515733 | 100 |
| 78.27389871141744 | 100 |
| 78.30386574767756 | 100 |
| 78.33383278393768 | 100 |
| 78.36379982019778 | 100 |
| 78.39376685645789 | 100 |
| 78.423733892718 | 100 |
| 78.45370092897812 | 100 |
| 78.48366796523824 | 100 |
| 78.51363500149834 | 100 |
| 78.54360203775846 | 100 |
| 78.57356907401858 | 100 |
| 78.6035361102787 | 100 |
| 78.63350314653881 | 100 |
| 78.66347018279892 | 100 |
| 78.69343721905904 | 100 |
| 78.72340425531915 | 100 |
| 78.75337129157927 | 100 |
| 78.78333832783937 | 100 |
| 78.81330536409949 | 100 |
| 78.84327240035961 | 100 |
| 78.87323943661971 | 100 |
| 78.90320647287983 | 100 |
| 78.93317350913995 | 100 |
| 78.96314054540005 | 100 |
| 78.99310758166017 | 100 |
| 79.02307461792029 | 100 |
| 79.0530416541804 | 100 |
| 79.08300869044052 | 100 |
| 79.11297572670063 | 100 |
| 79.14294276296074 | 100 |
| 79.17290979922086 | 100 |
| 79.20287683548098 | 100 |
| 79.23284387174108 | 100 |
| 79.2628109080012 | 100 |
| 79.29277794426132 | 100 |
| 79.32274498052143 | 100 |
| 79.35271201678155 | 100 |
| 79.38267905304166 | 100 |
| 79.41264608930176 | 100 |
| 79.44261312556188 | 100 |
| 79.472580161822 | 100 |
| 79.50254719808211 | 100 |
| 79.53251423434222 | 100 |
| 79.56248127060233 | 100 |
| 79.59244830686245 | 100 |
| 79.62241534312257 | 100 |
| 79.65238237938269 | 100 |
| 79.68234941564279 | 100 |
| 79.71231645190291 | 100 |
| 79.74228348816303 | 100 |
| 79.77225052442314 | 100 |
| 79.80221756068325 | 100 |
| 79.83218459694336 | 100 |
| 79.86215163320347 | 100 |
| 79.89211866946358 | 100 |
| 79.9220857057237 | 100 |
| 79.95205274198382 | 100 |
| 79.98201977824392 | 100 |
| 80.01198681450404 | 100 |
| 80.04195385076416 | 100 |
| 80.07192088702428 | 100 |
| 80.10188792328438 | 100 |
| 80.1318549595445 | 100 |
| 80.16182199580462 | 100 |
| 80.19178903206473 | 100 |
| 80.22175606832485 | 100 |
| 80.25172310458495 | 100 |
| 80.28169014084507 | 100 |
| 80.31165717710519 | 100 |
| 80.34162421336531 | 100 |
| 80.37159124962541 | 100 |
| 80.40155828588553 | 100 |
| 80.43152532214563 | 100 |
| 80.46149235840575 | 100 |
| 80.49145939466587 | 100 |
| 80.52142643092598 | 100 |
| 80.55139346718609 | 100 |
| 80.5813605034462 | 100 |
| 80.61132753970632 | 100 |
| 80.64129457596644 | 100 |
| 80.67126161222656 | 100 |
| 80.70122864848666 | 100 |
| 80.73119568474678 | 100 |
| 80.7611627210069 | 100 |
| 80.79112975726702 | 100 |
| 80.82109679352712 | 100 |
| 80.85106382978722 | 100 |
| 80.88103086604734 | 100 |
| 80.91099790230746 | 100 |
| 80.94096493856757 | 100 |
| 80.97093197482769 | 100 |
| 81.0008990110878 | 100 |
| 81.03086604734791 | 100 |
| 81.06083308360803 | 100 |
| 81.09080011986815 | 100 |
| 81.12076715612827 | 100 |
| 81.15073419238837 | 100 |
| 81.18070122864849 | 100 |
| 81.2106682649086 | 100 |
| 81.24063530116872 | 100 |
| 81.27060233742883 | 100 |
| 81.30056937368894 | 100 |
| 81.33053640994906 | 100 |
| 81.36050344620917 | 100 |
| 81.39047048246928 | 100 |
| 81.4204375187294 | 100 |
| 81.4504045549895 | 100 |
| 81.48037159124962 | 100 |
| 81.51033862750974 | 100 |
| 81.54030566376986 | 100 |
| 81.57027270002996 | 100 |
| 81.60023973629008 | 100 |
| 81.6302067725502 | 100 |
| 81.66017380881031 | 100 |
| 81.69014084507043 | 100 |
| 81.72010788133053 | 100 |
| 81.75007491759065 | 100 |
| 81.78004195385077 | 100 |
| 81.81000899011089 | 100 |
| 81.83997602637099 | 100 |
| 81.8699430626311 | 100 |
| 81.89991009889121 | 100 |
| 81.92987713515133 | 100 |
| 81.95984417141145 | 100 |
| 81.98981120767156 | 100 |
| 82.01977824393167 | 100 |
| 82.04974528019179 | 100 |
| 82.0797123164519 | 100 |
| 82.10967935271202 | 100 |
| 82.13964638897212 | 100 |
| 82.16961342523224 | 100 |
| 82.19958046149236 | 100 |
| 82.22954749775248 | 100 |
| 82.2595145340126 | 100 |
| 82.2894815702727 | 100 |
| 82.31944860653282 | 100 |
| 82.34941564279292 | 100 |
| 82.37938267905304 | 100 |
| 82.40934971531316 | 100 |
| 82.43931675157327 | 100 |
| 82.46928378783338 | 100 |
| 82.4992508240935 | 100 |
| 82.52921786035361 | 100 |
| 82.55918489661373 | 100 |
| 82.58915193287383 | 100 |
| 82.61911896913395 | 100 |
| 82.64908600539407 | 100 |
| 82.67905304165419 | 100 |
| 82.7090200779143 | 100 |
| 82.7389871141744 | 100 |
| 82.76895415043452 | 100 |
| 82.79892118669464 | 100 |
| 82.82888822295476 | 100 |
| 82.85885525921486 | 100 |
| 82.88882229547497 | 100 |
| 82.91878933173508 | 100 |
| 82.9487563679952 | 100 |
| 82.97872340425532 | 100 |
| 83.00869044051544 | 100 |
| 83.03865747677554 | 100 |
| 83.06862451303566 | 100 |
| 83.09859154929578 | 100 |
| 83.1285585855559 | 100 |
| 83.15852562181601 | 100 |
| 83.18849265807611 | 100 |
| 83.21845969433623 | 100 |
| 83.24842673059635 | 100 |
| 83.27839376685647 | 100 |
| 83.30836080311657 | 100 |
| 83.33832783937667 | 100 |
| 83.36829487563679 | 100 |
| 83.39826191189691 | 100 |
| 83.42822894815703 | 100 |
| 83.45819598441715 | 100 |
| 83.48816302067725 | 100 |
| 83.51813005693737 | 100 |
| 83.54809709319748 | 100 |
| 83.5780641294576 | 100 |
| 83.6080311657177 | 100 |
| 83.63799820197782 | 100 |
| 83.66796523823794 | 100 |
| 83.69793227449806 | 100 |
| 83.72789931075818 | 100 |
| 83.75786634701828 | 100 |
| 83.7878333832784 | 100 |
| 83.81780041953851 | 100 |
| 83.84776745579862 | 100 |
| 83.87773449205874 | 100 |
| 83.90770152831884 | 100 |
| 83.93766856457896 | 100 |
| 83.96763560083907 | 100 |
| 83.99760263709919 | 100 |
| 84.02756967335931 | 100 |
| 84.05753670961941 | 100 |
| 84.08750374587953 | 100 |
| 84.11747078213965 | 100 |
| 84.14743781839977 | 100 |
| 84.17740485465987 | 100 |
| 84.20737189091999 | 100 |
| 84.2373389271801 | 100 |
| 84.26730596344022 | 100 |
| 84.29727299970034 | 100 |
| 84.32724003596044 | 100 |
| 84.35720707222055 | 100 |
| 84.38717410848066 | 100 |
| 84.41714114474078 | 100 |
| 84.4471081810009 | 100 |
| 84.47707521726102 | 100 |
| 84.50704225352112 | 100 |
| 84.53700928978124 | 100 |
| 84.56697632604136 | 100 |
| 84.59694336230147 | 100 |
| 84.62691039856158 | 100 |
| 84.6568774348217 | 100 |
| 84.68684447108181 | 100 |
| 84.71681150734193 | 100 |
| 84.74677854360205 | 100 |
| 84.77674557986215 | 100 |
| 84.80671261612227 | 100 |
| 84.83667965238237 | 100 |
| 84.86664668864249 | 100 |
| 84.89661372490261 | 100 |
| 84.92658076116271 | 100 |
| 84.95654779742283 | 100 |
| 84.98651483368295 | 100 |
| 85.01648186994306 | 100 |
| 85.04644890620318 | 100 |
| 85.07641594246329 | 100 |
| 85.1063829787234 | 100 |
| 85.13635001498352 | 100 |
| 85.16631705124364 | 100 |
| 85.19628408750376 | 100 |
| 85.22625112376386 | 100 |
| 85.25621816002398 | 100 |
| 85.2861851962841 | 100 |
| 85.31615223254421 | 100 |
| 85.34611926880432 | 100 |
| 85.37608630506442 | 100 |
| 85.40605334132454 | 100 |
| 85.43602037758465 | 100 |
| 85.46598741384477 | 100 |
| 85.49595445010489 | 100 |
| 85.525921486365 | 100 |
| 85.55588852262511 | 100 |
| 85.58585555888523 | 100 |
| 85.61582259514535 | 100 |
| 85.64578963140545 | 100 |
| 85.67575666766557 | 100 |
| 85.70572370392568 | 100 |
| 85.7356907401858 | 100 |
| 85.76565777644592 | 100 |
| 85.79562481270602 | 100 |
| 85.82559184896613 | 100 |
| 85.85555888522624 | 100 |
| 85.88552592148636 | 100 |
| 85.91549295774648 | 100 |
| 85.94545999400658 | 100 |
| 85.9754270302667 | 100 |
| 86.00539406652682 | 100 |
| 86.03536110278694 | 100 |
| 86.06532813904705 | 100 |
| 86.09529517530716 | 100 |
| 86.12526221156728 | 100 |
| 86.15522924782739 | 100 |
| 86.18519628408751 | 100 |
| 86.21516332034761 | 100 |
| 86.24513035660773 | 100 |
| 86.27509739286785 | 100 |
| 86.30506442912797 | 100 |
| 86.33503146538807 | 100 |
| 86.36499850164819 | 100 |
| 86.39496553790829 | 100 |
| 86.42493257416841 | 100 |
| 86.45489961042853 | 100 |
| 86.48486664668864 | 100 |
| 86.51483368294876 | 100 |
| 86.54480071920887 | 100 |
| 86.57476775546898 | 100 |
| 86.6047347917291 | 100 |
| 86.63470182798922 | 100 |
| 86.66466886424932 | 100 |
| 86.69463590050944 | 100 |
| 86.72460293676956 | 100 |
| 86.75456997302967 | 100 |
| 86.78453700928979 | 100 |
| 86.8145040455499 | 100 |
| 86.84447108181 | 100 |
| 86.87443811807012 | 100 |
| 86.90440515433023 | 100 |
| 86.93437219059035 | 100 |
| 86.96433922685046 | 100 |
| 86.99430626311057 | 100 |
| 87.02427329937069 | 100 |
| 87.05424033563081 | 100 |
| 87.08420737189093 | 100 |
| 87.11417440815103 | 100 |
| 87.14414144441115 | 100 |
| 87.17410848067126 | 100 |
| 87.20407551693138 | 100 |
| 87.2340425531915 | 100 |
| 87.2640095894516 | 100 |
| 87.29397662571172 | 100 |
| 87.32394366197182 | 100 |
| 87.35391069823194 | 100 |
| 87.38387773449206 | 100 |
| 87.41384477075216 | 100 |
| 87.44381180701228 | 100 |
| 87.4737788432724 | 100 |
| 87.50374587953252 | 100 |
| 87.53371291579263 | 100 |
| 87.56367995205274 | 100 |
| 87.59364698831286 | 100 |
| 87.62361402457297 | 100 |
| 87.65358106083309 | 100 |
| 87.6835480970932 | 100 |
| 87.71351513335331 | 100 |
| 87.74348216961343 | 100 |
| 87.77344920587355 | 100 |
| 87.80341624213366 | 100 |
| 87.83338327839377 | 100 |
| 87.86335031465387 | 100 |
| 87.89331735091399 | 100 |
| 87.9232843871741 | 100 |
| 87.95325142343422 | 100 |
| 87.98321845969433 | 100 |
| 88.01318549595445 | 100 |
| 88.04315253221456 | 100 |
| 88.07311956847468 | 100 |
| 88.1030866047348 | 100 |
| 88.1330536409949 | 100 |
| 88.16302067725502 | 100 |
| 88.19298771351514 | 100 |
| 88.22295474977525 | 100 |
| 88.25292178603536 | 100 |
| 88.28288882229548 | 100 |
| 88.31285585855558 | 100 |
| 88.3428228948157 | 100 |
| 88.37278993107581 | 100 |
| 88.40275696733593 | 100 |
| 88.43272400359604 | 100 |
| 88.46269103985615 | 100 |
| 88.49265807611627 | 100 |
| 88.52262511237639 | 100 |
| 88.5525921486365 | 100 |
| 88.58255918489661 | 100 |
| 88.61252622115673 | 100 |
| 88.64249325741685 | 100 |
| 88.67246029367696 | 100 |
| 88.70242732993707 | 100 |
| 88.73239436619718 | 100 |
| 88.7623614024573 | 100 |
| 88.79232843871742 | 100 |
| 88.82229547497752 | 100 |
| 88.85226251123764 | 100 |
| 88.88222954749774 | 100 |
| 88.91219658375786 | 100 |
| 88.94216362001798 | 100 |
| 88.9721306562781 | 100 |
| 89.0020976925382 | 100 |
| 89.03206472879832 | 100 |
| 89.06203176505844 | 100 |
| 89.09199880131855 | 100 |
| 89.12196583757867 | 100 |
| 89.15193287383877 | 100 |
| 89.18189991009889 | 100 |
| 89.21186694635901 | 100 |
| 89.24183398261913 | 100 |
| 89.27180101887924 | 100 |
| 89.30176805513935 | 100 |
| 89.33173509139945 | 100 |
| 89.36170212765957 | 100 |
| 89.39166916391969 | 100 |
| 89.4216362001798 | 100 |
| 89.45160323643991 | 100 |
| 89.48157027270003 | 100 |
| 89.51153730896014 | 100 |
| 89.54150434522026 | 100 |
| 89.57147138148038 | 100 |
| 89.60143841774048 | 100 |
| 89.6314054540006 | 100 |
| 89.66137249026072 | 100 |
| 89.69133952652084 | 100 |
| 89.72130656278094 | 100 |
| 89.75127359904106 | 100 |
| 89.78124063530117 | 100 |
| 89.81120767156128 | 100 |
| 89.8411747078214 | 100 |
| 89.87114174408151 | 100 |
| 89.90110878034162 | 100 |
| 89.93107581660173 | 100 |
| 89.96104285286185 | 100 |
| 89.99100988912197 | 100 |
| 90.02097692538207 | 100 |
| 90.05094396164219 | 100 |
| 90.08091099790231 | 100 |
| 90.11087803416243 | 100 |
| 90.14084507042254 | 100 |
| 90.17081210668265 | 100 |
| 90.20077914294276 | 100 |
| 90.23074617920288 | 100 |
| 90.260713215463 | 100 |
| 90.2906802517231 | 100 |
| 90.3206472879832 | 100 |
| 90.35061432424332 | 100 |
| 90.38058136050344 | 100 |
| 90.41054839676356 | 100 |
| 90.44051543302368 | 100 |
| 90.47048246928378 | 100 |
| 90.5004495055439 | 100 |
| 90.53041654180402 | 100 |
| 90.56038357806413 | 100 |
| 90.59035061432425 | 100 |
| 90.62031765058435 | 100 |
| 90.65028468684447 | 100 |
| 90.65028468684447 | 100 |
| 90.68025172310459 | 100 |
| 90.71021875936471 | 100 |
| 90.71021875936471 | 100 |
| 90.74018579562481 | 100 |
| 90.77015283188493 | 100 |
| 90.80011986814503 | 100 |
| 90.83008690440515 | 100 |
| 90.86005394066527 | 100 |
| 90.89002097692538 | 100 |
| 90.91998801318549 | 100 |
| 90.9499550494456 | 100 |
| 90.97992208570572 | 100 |
| 91.00988912196584 | 100 |
| 91.03985615822594 | 100 |
| 91.06982319448606 | 100 |
| 91.09979023074618 | 100 |
| 91.1297572670063 | 100 |
| 91.15972430326642 | 100 |
| 91.18969133952652 | 100 |
| 91.21965837578664 | 100 |
| 91.24962541204675 | 100 |
| 91.27959244830687 | 100 |
| 91.30955948456698 | 100 |
| 91.33952652082709 | 100 |
| 91.3694935570872 | 100 |
| 91.39946059334731 | 100 |
| 91.42942762960743 | 100 |
| 91.45939466586755 | 100 |
| 91.48936170212765 | 100 |
| 91.51932873838777 | 100 |
| 91.54929577464789 | 100 |
| 91.579262810908 | 100 |
| 91.60922984716812 | 100 |
| 91.60922984716812 | 100 |
| 91.63919688342823 | 100 |
| 91.66916391968834 | 100 |
| 91.69913095594846 | 100 |
| 91.72909799220858 | 100 |
| 91.75906502846868 | 100 |
| 91.7890320647288 | 100 |
| 91.8189991009889 | 100 |
| 91.84896613724902 | 100 |
| 91.87893317350914 | 100 |
| 91.90890020976926 | 100 |
| 91.93886724602936 | 100 |
| 91.96883428228948 | 100 |
| 91.9988013185496 | 100 |
| 92.02876835480971 | 100 |
| 92.05873539106982 | 100 |
| 92.08870242732993 | 100 |
| 92.11866946359005 | 100 |
| 92.14863649985017 | 100 |
| 92.17860353611029 | 100 |
| 92.20857057237039 | 100 |
| 92.23853760863051 | 100 |
| 92.26850464489063 | 100 |
| 92.29847168115073 | 100 |
| 92.32843871741085 | 100 |
| 92.35840575367095 | 100 |
| 92.38837278993107 | 100 |
| 92.41833982619119 | 100 |
| 92.4483068624513 | 100 |
| 92.47827389871142 | 100 |
| 92.50824093497152 | 100 |
| 92.50824093497152 | 100 |
| 92.53820797123164 | 100 |
| 92.56817500749176 | 100 |
| 92.59814204375188 | 100 |
| 92.628109080012 | 100 |
| 92.6580761162721 | 100 |
| 92.68804315253222 | 100 |
| 92.71801018879233 | 100 |
| 92.74797722505245 | 100 |
| 92.77794426131256 | 100 |
| 92.80791129757266 | 100 |
| 92.83787833383278 | 100 |
| 92.8678453700929 | 100 |
| 92.89781240635301 | 100 |
| 92.92777944261313 | 100 |
| 92.95774647887323 | 100 |
| 92.98771351513335 | 100 |
| 93.01768055139347 | 100 |
| 93.04764758765359 | 100 |
| 93.07761462391369 | 100 |
| 93.1075816601738 | 100 |
| 93.13754869643392 | 100 |
| 93.16751573269404 | 100 |
| 93.19748276895416 | 100 |
| 93.22744980521426 | 100 |
| 93.25741684147438 | 100 |
| 93.28738387773448 | 100 |
| 93.3173509139946 | 100 |
| 93.34731795025472 | 100 |
| 93.37728498651484 | 100 |
| 93.40725202277494 | 100 |
| 93.43721905903506 | 100 |
| 93.46718609529518 | 100 |
| 93.4971531315553 | 100 |
| 93.5271201678154 | 100 |
| 93.55708720407551 | 100 |
| 93.58705424033563 | 100 |
| 93.61702127659575 | 100 |
| 93.64698831285587 | 100 |
| 93.67695534911597 | 100 |
| 93.70692238537609 | 100 |
| 93.7368894216362 | 100 |
| 93.76685645789632 | 100 |
| 93.79682349415643 | 100 |
| 93.79682349415643 | 100 |
| 93.82679053041653 | 100 |
| 93.85675756667665 | 100 |
| 93.88672460293677 | 100 |
| 93.91669163919688 | 100 |
| 93.946658675457 | 100 |
| 93.9766257117171 | 100 |
| 94.00659274797722 | 100 |
| 94.03655978423734 | 100 |
| 94.06652682049746 | 100 |
| 94.09649385675756 | 100 |
| 94.12646089301768 | 100 |
| 94.1564279292778 | 100 |
| 94.18639496553791 | 100 |
| 94.21636200179803 | 100 |
| 94.24632903805814 | 100 |
| 94.27629607431825 | 100 |
| 94.30626311057836 | 100 |
| 94.33623014683847 | 100 |
| 94.36619718309859 | 100 |
| 94.3961642193587 | 100 |
| 94.42613125561881 | 100 |
| 94.45609829187893 | 100 |
| 94.48606532813905 | 100 |
| 94.51603236439917 | 100 |
| 94.54599940065927 | 100 |
| 94.57596643691939 | 100 |
| 94.6059334731795 | 100 |
| 94.63590050943962 | 100 |
| 94.66586754569974 | 100 |
| 94.69583458195984 | 100 |
| 94.72580161821996 | 100 |
| 94.75576865448008 | 100 |
| 94.78573569074018 | 100 |
| 94.8157027270003 | 100 |
| 94.8456697632604 | 100 |
| 94.87563679952052 | 100 |
| 94.90560383578064 | 100 |
| 94.93557087204076 | 100 |
| 94.96553790830087 | 100 |
| 94.99550494456098 | 100 |
| 95.0254719808211 | 100 |
| 95.05543901708121 | 100 |
| 95.08540605334133 | 100 |
| 95.11537308960143 | 100 |
| 95.14534012586155 | 100 |
| 95.17530716212167 | 100 |
| 95.20527419838179 | 100 |
| 95.2352412346419 | 100 |
| 95.26520827090201 | 100 |
| 95.29517530716211 | 100 |
| 95.32514234342223 | 100 |
| 95.35510937968235 | 100 |
| 95.38507641594246 | 100 |
| 95.41504345220258 | 100 |
| 95.44501048846269 | 100 |
| 95.4749775247228 | 100 |
| 95.50494456098292 | 100 |
| 95.53491159724304 | 100 |
| 95.56487863350314 | 100 |
| 95.59484566976326 | 100 |
| 95.62481270602338 | 100 |
| 95.6547797422835 | 100 |
| 95.68474677854361 | 100 |
| 95.71471381480372 | 100 |
| 95.74468085106383 | 100 |
| 95.77464788732394 | 100 |
| 95.80461492358405 | 100 |
| 95.83458195984417 | 100 |
| 95.86454899610428 | 100 |
| 95.8945160323644 | 100 |
| 95.92448306862451 | 100 |
| 95.95445010488463 | 100 |
| 95.98441714114475 | 100 |
| 96.01438417740485 | 100 |
| 96.04435121366497 | 100 |
| 96.07431824992508 | 100 |
| 96.1042852861852 | 100 |
| 96.1342523224453 | 100 |
| 96.16421935870542 | 100 |
| 96.19418639496554 | 100 |
| 96.22415343122566 | 100 |
| 96.25412046748578 | 100 |
| 96.28408750374588 | 100 |
| 96.31405454000598 | 100 |
| 96.3440215762661 | 100 |
| 96.37398861252622 | 100 |
| 96.40395564878634 | 100 |
| 96.43392268504644 | 100 |
| 96.46388972130656 | 100 |
| 96.49385675756668 | 100 |
| 96.52382379382679 | 100 |
| 96.55379083008691 | 100 |
| 96.58375786634701 | 100 |
| 96.61372490260713 | 100 |
| 96.64369193886725 | 100 |
| 96.67365897512737 | 100 |
| 96.70362601138748 | 100 |
| 96.73359304764759 | 100 |
| 96.7635600839077 | 100 |
| 96.79352712016781 | 100 |
| 96.82349415642793 | 100 |
| 96.85346119268804 | 100 |
| 96.88342822894815 | 100 |
| 96.91339526520827 | 100 |
| 96.94336230146838 | 100 |
| 96.9733293377285 | 100 |
| 97.00329637398862 | 100 |
| 97.03326341024872 | 100 |
| 97.06323044650884 | 100 |
| 97.09319748276896 | 100 |
| 97.12316451902907 | 100 |
| 97.15313155528918 | 100 |
| 97.1830985915493 | 100 |
| 97.21306562780941 | 100 |
| 97.24303266406953 | 100 |
| 97.27299970032963 | 100 |
| 97.30296673658975 | 100 |
| 97.33293377284986 | 100 |
| 97.36290080910997 | 100 |
| 97.39286784537009 | 100 |
| 97.42283488163021 | 100 |
| 97.45280191789033 | 100 |
| 97.48276895415043 | 100 |
| 97.51273599041055 | 100 |
| 97.54270302667067 | 100 |
| 97.57267006293078 | 100 |
| 97.60263709919089 | 100 |
| 97.632604135451 | 100 |
| 97.66257117171112 | 100 |
| 97.69253820797124 | 100 |
| 97.72250524423136 | 100 |
| 97.75247228049146 | 100 |
| 97.78243931675156 | 100 |
| 97.81240635301168 | 100 |
| 97.8423733892718 | 100 |
| 97.87234042553192 | 100 |
| 97.90230746179202 | 100 |
| 97.93227449805214 | 100 |
| 97.96224153431226 | 100 |
| 97.99220857057237 | 100 |
| 98.02217560683249 | 100 |
| 98.0521426430926 | 100 |
| 98.08210967935271 | 100 |
| 98.11207671561283 | 100 |
| 98.14204375187295 | 100 |
| 98.17201078813305 | 100 |
| 98.20197782439317 | 100 |
| 98.23194486065329 | 100 |
| 98.26191189691339 | 100 |
| 98.2918789331735 | 100 |
| 98.32184596943362 | 100 |
| 98.35181300569373 | 100 |
| 98.38178004195385 | 100 |
| 98.41174707821396 | 100 |
| 98.44171411447408 | 100 |
| 98.47168115073418 | 100 |
| 98.5016481869943 | 100 |
| 98.53161522325442 | 100 |
| 98.56158225951454 | 100 |
| 98.59154929577466 | 100 |
| 98.62151633203476 | 100 |
| 98.65148336829488 | 100 |
| 98.681450404555 | 100 |
| 98.71141744081511 | 100 |
| 98.74138447707523 | 100 |
| 98.77135151333533 | 100 |
| 98.80131854959544 | 100 |
| 98.83128558585555 | 100 |
| 98.86125262211567 | 100 |
| 98.89121965837579 | 100 |
| 98.89121965837579 | 100 |
| 98.92118669463589 | 100 |
| 98.95115373089601 | 100 |
| 98.98112076715613 | 100 |
| 98.98112076715613 | 100 |
| 99.01108780341625 | 100 |
| 99.04105483967636 | 100 |
| 99.07102187593647 | 100 |
| 99.10098891219658 | 100 |
| 99.10098891219658 | 100 |
| 99.1309559484567 | 100 |
| 99.16092298471682 | 100 |
| 99.16092298471682 | 100 |
| 99.19089002097692 | 100 |
| 99.22085705723704 | 100 |
| 99.25082409349716 | 100 |
| 99.28079112975726 | 100 |
| 99.28079112975726 | 100 |
| 99.31075816601738 | 100 |
| 99.31075816601738 | 100 |
| 99.3407252022775 | 100 |
| 99.3706922385376 | 100 |
| 99.40065927479772 | 100 |
| 99.40065927479772 | 100 |
| 99.43062631105784 | 100 |
| 99.46059334731795 | 100 |
| 99.49056038357807 | 100 |
| 99.49056038357807 | 100 |
| 99.49056038357807 | 100 |
| 99.52052741983817 | 100 |
| 99.55049445609829 | 100 |
| 99.55049445609829 | 100 |
| 99.55049445609829 | 100 |
| 99.58046149235841 | 100 |
| 99.58046149235841 | 100 |
| 99.61042852861853 | 100 |
| 99.64039556487863 | 100 |
| 99.64039556487863 | 100 |
| 99.67036260113875 | 100 |
| 99.70032963739887 | 100 |
| 99.73029667365898 | 100 |
| 99.76026370991909 | 100 |
| 99.7902307461792 | 100 |
| 99.82019778243931 | 100 |
| 99.85016481869943 | 100 |
| 99.88013185495954 | 100 |
| 99.91009889121966 | 100 |
| 99.94006592747976 | 100 |
| 99.97003296373988 | 100 |
| 100.0 | 100 |